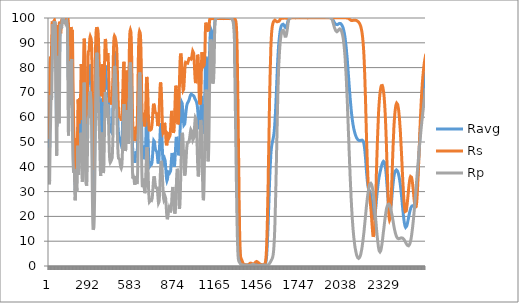
| Category | Ravg | Rs | Rp |
|---|---|---|---|
| 0 | 53.608 | 59.483 | 47.732 |
| 1 | 46.435 | 53.007 | 39.864 |
| 2 | 43.023 | 51.221 | 34.826 |
| 3 | 43.86 | 54.74 | 32.981 |
| 4 | 48.45 | 62.311 | 34.59 |
| 5 | 55.07 | 71.234 | 38.905 |
| 6 | 61.067 | 78.057 | 44.077 |
| 7 | 65.373 | 82.261 | 48.486 |
| 8 | 67.951 | 83.219 | 52.683 |
| 9 | 69.086 | 83.364 | 54.809 |
| 10 | 70.093 | 83.365 | 56.821 |
| 11 | 71.622 | 83.523 | 59.721 |
| 12 | 73.597 | 83.551 | 63.643 |
| 13 | 75.091 | 83.333 | 66.849 |
| 14 | 75.85 | 82.789 | 68.911 |
| 15 | 75.43 | 82.052 | 68.808 |
| 16 | 75.657 | 83.915 | 67.399 |
| 17 | 76.655 | 86.403 | 66.907 |
| 18 | 79.3 | 89.995 | 68.604 |
| 19 | 81.838 | 92.304 | 71.373 |
| 20 | 85.746 | 95.227 | 76.266 |
| 21 | 89.017 | 97.914 | 80.121 |
| 22 | 90.354 | 98.591 | 82.118 |
| 23 | 92.334 | 98.243 | 86.425 |
| 24 | 94.664 | 97.848 | 91.479 |
| 25 | 96.153 | 97.268 | 95.039 |
| 26 | 96.717 | 95.844 | 97.589 |
| 27 | 96.232 | 95.397 | 97.068 |
| 28 | 95.586 | 94.821 | 96.35 |
| 29 | 95.021 | 95.249 | 94.792 |
| 30 | 94.859 | 95.882 | 93.835 |
| 31 | 95.255 | 97.491 | 93.02 |
| 32 | 96.392 | 98.593 | 94.19 |
| 33 | 96.959 | 98.517 | 95.401 |
| 34 | 98.014 | 98.845 | 97.183 |
| 35 | 98.073 | 98.319 | 97.827 |
| 36 | 98.862 | 98.97 | 98.753 |
| 37 | 98.501 | 99.106 | 97.896 |
| 38 | 98.467 | 98.933 | 98 |
| 39 | 98.495 | 98.521 | 98.469 |
| 40 | 98.091 | 98.214 | 97.968 |
| 41 | 97.955 | 97.908 | 98.002 |
| 42 | 97.713 | 97.745 | 97.682 |
| 43 | 96.801 | 97.075 | 96.527 |
| 44 | 95.317 | 96.78 | 93.855 |
| 45 | 92.409 | 95.388 | 89.43 |
| 46 | 89.204 | 93.428 | 84.98 |
| 47 | 83.43 | 89.397 | 77.463 |
| 48 | 76.467 | 83.704 | 69.23 |
| 49 | 70.578 | 78.604 | 62.553 |
| 50 | 63.555 | 72.074 | 55.035 |
| 51 | 58.176 | 68.068 | 48.284 |
| 52 | 56.482 | 68.474 | 44.489 |
| 53 | 57.531 | 70.824 | 44.237 |
| 54 | 61.851 | 76.848 | 46.855 |
| 55 | 67.634 | 82.83 | 52.437 |
| 56 | 73.404 | 88.155 | 58.653 |
| 57 | 77.216 | 90.521 | 63.911 |
| 58 | 78.101 | 90.717 | 65.485 |
| 59 | 78.055 | 90.796 | 65.315 |
| 60 | 78.289 | 91.863 | 64.715 |
| 61 | 79.57 | 93.351 | 65.79 |
| 62 | 82.723 | 95.972 | 69.474 |
| 63 | 86.717 | 97.104 | 76.33 |
| 64 | 89.701 | 96.913 | 82.489 |
| 65 | 90.117 | 95.512 | 84.722 |
| 66 | 87.386 | 94.354 | 80.418 |
| 67 | 83.358 | 93.577 | 73.139 |
| 68 | 79.853 | 93.706 | 66 |
| 69 | 77.437 | 94.698 | 60.175 |
| 70 | 76.982 | 96.374 | 57.59 |
| 71 | 78.911 | 98.018 | 59.805 |
| 72 | 82.765 | 98.522 | 67.008 |
| 73 | 87.083 | 98.772 | 75.394 |
| 74 | 90.975 | 98.584 | 83.367 |
| 75 | 93.929 | 98.116 | 89.743 |
| 76 | 95.429 | 96.879 | 93.98 |
| 77 | 96.108 | 96.204 | 96.013 |
| 78 | 95.869 | 94.845 | 96.893 |
| 79 | 95.795 | 94.46 | 97.131 |
| 80 | 95.501 | 93.86 | 97.141 |
| 81 | 95.938 | 94.297 | 97.579 |
| 82 | 96.341 | 94.928 | 97.755 |
| 83 | 96.363 | 95.673 | 97.054 |
| 84 | 96.686 | 96.972 | 96.399 |
| 85 | 97.184 | 98.199 | 96.169 |
| 86 | 97.34 | 98.812 | 95.869 |
| 87 | 97.451 | 99.042 | 95.861 |
| 88 | 97.802 | 99.251 | 96.353 |
| 89 | 98.426 | 99.305 | 97.546 |
| 90 | 98.998 | 99.322 | 98.673 |
| 91 | 99.308 | 99.335 | 99.28 |
| 92 | 99.465 | 99.456 | 99.474 |
| 93 | 99.501 | 99.427 | 99.574 |
| 94 | 99.476 | 99.576 | 99.377 |
| 95 | 99.521 | 99.285 | 99.756 |
| 96 | 99.591 | 99.555 | 99.626 |
| 97 | 99.441 | 99.423 | 99.46 |
| 98 | 99.414 | 99.227 | 99.601 |
| 99 | 99.343 | 99.273 | 99.414 |
| 100 | 99.459 | 99.305 | 99.613 |
| 101 | 99.152 | 99.007 | 99.297 |
| 102 | 99.079 | 98.85 | 99.308 |
| 103 | 99.044 | 98.969 | 99.119 |
| 104 | 98.918 | 98.916 | 98.919 |
| 105 | 98.894 | 98.79 | 98.998 |
| 106 | 98.459 | 98.492 | 98.425 |
| 107 | 98.463 | 98.42 | 98.507 |
| 108 | 98.369 | 98.374 | 98.364 |
| 109 | 98.419 | 98.354 | 98.483 |
| 110 | 98.512 | 98.496 | 98.528 |
| 111 | 98.616 | 98.635 | 98.596 |
| 112 | 98.837 | 98.885 | 98.788 |
| 113 | 98.744 | 98.841 | 98.647 |
| 114 | 98.577 | 98.831 | 98.323 |
| 115 | 98.549 | 99.073 | 98.024 |
| 116 | 98.445 | 99.139 | 97.751 |
| 117 | 98.543 | 99.363 | 97.723 |
| 118 | 98.503 | 99.26 | 97.745 |
| 119 | 98.514 | 99.322 | 97.706 |
| 120 | 98.556 | 99.254 | 97.858 |
| 121 | 98.848 | 99.37 | 98.326 |
| 122 | 99.043 | 99.367 | 98.72 |
| 123 | 99.096 | 99.326 | 98.866 |
| 124 | 99.157 | 99.43 | 98.884 |
| 125 | 98.893 | 99.463 | 98.323 |
| 126 | 98.201 | 99.461 | 96.942 |
| 127 | 96.636 | 99.291 | 93.981 |
| 128 | 94.105 | 99.371 | 88.839 |
| 129 | 89.858 | 99.375 | 80.341 |
| 130 | 86.189 | 99.455 | 72.924 |
| 131 | 82.724 | 99.415 | 66.032 |
| 132 | 79.264 | 99.243 | 59.285 |
| 133 | 76.435 | 98.564 | 54.305 |
| 134 | 74.607 | 96.603 | 52.611 |
| 135 | 74.09 | 93.672 | 54.508 |
| 136 | 73.937 | 90.207 | 57.667 |
| 137 | 73.575 | 86.165 | 60.986 |
| 138 | 72.733 | 82.101 | 63.364 |
| 139 | 71.712 | 79.074 | 64.351 |
| 140 | 71.503 | 78.467 | 64.538 |
| 141 | 72.052 | 79.35 | 64.754 |
| 142 | 73.047 | 80.376 | 65.718 |
| 143 | 74.218 | 81.314 | 67.122 |
| 144 | 76.141 | 82.582 | 69.7 |
| 145 | 78.984 | 84.469 | 73.498 |
| 146 | 81.883 | 85.963 | 77.803 |
| 147 | 84.302 | 87.169 | 81.435 |
| 148 | 85.851 | 89.17 | 82.532 |
| 149 | 87.245 | 92.421 | 82.07 |
| 150 | 88.043 | 95.18 | 80.906 |
| 151 | 88.315 | 96.372 | 80.258 |
| 152 | 88.188 | 96.476 | 79.899 |
| 153 | 87.9 | 95.435 | 80.364 |
| 154 | 87.971 | 94.372 | 81.57 |
| 155 | 88.277 | 93.628 | 82.926 |
| 156 | 88.403 | 93.327 | 83.479 |
| 157 | 87.569 | 93.223 | 81.915 |
| 158 | 85.62 | 93.823 | 77.418 |
| 159 | 83.307 | 94.395 | 72.22 |
| 160 | 79.974 | 95.185 | 64.763 |
| 161 | 76.198 | 94.381 | 58.016 |
| 162 | 71.88 | 91.211 | 52.549 |
| 163 | 67.031 | 85.914 | 48.147 |
| 164 | 62.273 | 79.663 | 44.883 |
| 165 | 58.599 | 74.446 | 42.752 |
| 166 | 56.364 | 71.18 | 41.547 |
| 167 | 53.436 | 66.684 | 40.187 |
| 168 | 50.758 | 62.759 | 38.757 |
| 169 | 48.576 | 59.497 | 37.655 |
| 170 | 47.149 | 57.046 | 37.253 |
| 171 | 45.937 | 54.502 | 37.373 |
| 172 | 45.414 | 52.798 | 38.03 |
| 173 | 44.888 | 50.834 | 38.942 |
| 174 | 44.286 | 49.634 | 38.939 |
| 175 | 43.589 | 49.645 | 37.532 |
| 176 | 42.224 | 49.611 | 34.837 |
| 177 | 40.179 | 48.639 | 31.72 |
| 178 | 37.287 | 45.693 | 28.882 |
| 179 | 34.264 | 41.393 | 27.135 |
| 180 | 32.247 | 37.999 | 26.494 |
| 181 | 30.571 | 34.287 | 26.855 |
| 182 | 30.315 | 32.44 | 28.191 |
| 183 | 31.506 | 33.014 | 29.999 |
| 184 | 33.687 | 35.505 | 31.87 |
| 185 | 36.59 | 39.681 | 33.499 |
| 186 | 39.305 | 44.121 | 34.49 |
| 187 | 41.421 | 48.145 | 34.698 |
| 188 | 42.486 | 50.901 | 34.071 |
| 189 | 42.09 | 51.621 | 32.559 |
| 190 | 40.496 | 50.023 | 30.969 |
| 191 | 38.647 | 47.44 | 29.854 |
| 192 | 37.428 | 44.8 | 30.055 |
| 193 | 37.415 | 43.256 | 31.573 |
| 194 | 38.949 | 43.371 | 34.526 |
| 195 | 41.984 | 45.332 | 38.635 |
| 196 | 46.026 | 49.079 | 42.972 |
| 197 | 50.354 | 54.182 | 46.526 |
| 198 | 54.06 | 59.632 | 48.489 |
| 199 | 56.118 | 64.049 | 48.187 |
| 200 | 56.406 | 66.634 | 46.178 |
| 201 | 55.095 | 67.144 | 43.045 |
| 202 | 52.978 | 65.912 | 40.044 |
| 203 | 50.144 | 62.727 | 37.561 |
| 204 | 48.413 | 59.997 | 36.83 |
| 205 | 47.707 | 58.114 | 37.301 |
| 206 | 48.113 | 57.523 | 38.703 |
| 207 | 49.241 | 57.899 | 40.583 |
| 208 | 50.864 | 59.462 | 42.267 |
| 209 | 52.944 | 62.443 | 43.444 |
| 210 | 54.112 | 64.91 | 43.313 |
| 211 | 54.851 | 66.922 | 42.781 |
| 212 | 54.762 | 67.67 | 41.854 |
| 213 | 54.342 | 67.057 | 41.627 |
| 214 | 54.061 | 66.236 | 41.887 |
| 215 | 54.467 | 65.886 | 43.048 |
| 216 | 55.835 | 66.274 | 45.396 |
| 217 | 57.604 | 67.475 | 47.733 |
| 218 | 60.353 | 70.077 | 50.629 |
| 219 | 62.86 | 73.208 | 52.513 |
| 220 | 65.431 | 77.16 | 53.701 |
| 221 | 66.684 | 79.825 | 53.543 |
| 222 | 66.899 | 81.464 | 52.334 |
| 223 | 65.587 | 81.52 | 49.654 |
| 224 | 62.937 | 79.634 | 46.239 |
| 225 | 60.214 | 77.056 | 43.372 |
| 226 | 56.524 | 73.111 | 39.938 |
| 227 | 53.706 | 69.797 | 37.614 |
| 228 | 50.51 | 65.733 | 35.286 |
| 229 | 48.088 | 62.181 | 33.995 |
| 230 | 47.027 | 60.121 | 33.932 |
| 231 | 46.936 | 58.944 | 34.929 |
| 232 | 48.378 | 59.592 | 37.164 |
| 233 | 50.5 | 61.281 | 39.719 |
| 234 | 54.137 | 64.52 | 43.753 |
| 235 | 58.521 | 68.477 | 48.565 |
| 236 | 63.361 | 72.911 | 53.811 |
| 237 | 67.374 | 76.717 | 58.03 |
| 238 | 72.332 | 81.597 | 63.067 |
| 239 | 76.687 | 85.744 | 67.63 |
| 240 | 79.946 | 88.999 | 70.894 |
| 241 | 81.9 | 90.788 | 73.012 |
| 242 | 82.799 | 91.661 | 73.937 |
| 243 | 82.668 | 91.755 | 73.58 |
| 244 | 81.428 | 91.016 | 71.84 |
| 245 | 79.306 | 89.786 | 68.827 |
| 246 | 76.294 | 87.88 | 64.708 |
| 247 | 73.23 | 85.715 | 60.745 |
| 248 | 68.789 | 82.586 | 54.991 |
| 249 | 64.043 | 78.823 | 49.262 |
| 250 | 59.616 | 74.923 | 44.31 |
| 251 | 55.467 | 70.804 | 40.13 |
| 252 | 52.031 | 67.029 | 37.033 |
| 253 | 49.355 | 63.787 | 34.923 |
| 254 | 47.381 | 61.006 | 33.755 |
| 255 | 46.4 | 59.491 | 33.309 |
| 256 | 45.826 | 58.563 | 33.089 |
| 257 | 45.34 | 57.857 | 32.823 |
| 258 | 44.894 | 57.278 | 32.51 |
| 259 | 44.723 | 57.035 | 32.41 |
| 260 | 45.084 | 57.352 | 32.816 |
| 261 | 46.368 | 58.699 | 34.038 |
| 262 | 48.505 | 60.741 | 36.27 |
| 263 | 51.361 | 63.396 | 39.326 |
| 264 | 54.827 | 66.529 | 43.126 |
| 265 | 58.631 | 69.965 | 47.297 |
| 266 | 62.666 | 73.91 | 51.421 |
| 267 | 66.483 | 78.011 | 54.955 |
| 268 | 69.662 | 81.654 | 57.67 |
| 269 | 71.732 | 84.255 | 59.208 |
| 270 | 72.759 | 85.671 | 59.846 |
| 271 | 73.195 | 86.409 | 59.982 |
| 272 | 73.159 | 86.423 | 59.894 |
| 273 | 73.195 | 86.453 | 59.936 |
| 274 | 73.357 | 86.43 | 60.285 |
| 275 | 73.793 | 86.497 | 61.089 |
| 276 | 74.632 | 86.863 | 62.402 |
| 277 | 75.978 | 87.765 | 64.192 |
| 278 | 77.324 | 88.684 | 65.965 |
| 279 | 78.514 | 89.665 | 67.364 |
| 280 | 79.812 | 90.715 | 68.909 |
| 281 | 80.758 | 91.652 | 69.863 |
| 282 | 81.254 | 92.166 | 70.341 |
| 283 | 81.388 | 92.423 | 70.352 |
| 284 | 81.372 | 92.629 | 70.116 |
| 285 | 81.024 | 92.45 | 69.598 |
| 286 | 80.708 | 92.423 | 68.994 |
| 287 | 80.338 | 92.181 | 68.495 |
| 288 | 79.936 | 92.064 | 67.808 |
| 289 | 79.477 | 91.921 | 67.032 |
| 290 | 78.732 | 91.638 | 65.825 |
| 291 | 77.848 | 91.347 | 64.349 |
| 292 | 76.177 | 90.584 | 61.771 |
| 293 | 73.722 | 89.334 | 58.11 |
| 294 | 70.922 | 87.492 | 54.353 |
| 295 | 67.296 | 84.783 | 49.809 |
| 296 | 61.693 | 79.908 | 43.477 |
| 297 | 56.572 | 74.991 | 38.153 |
| 298 | 49.999 | 68.146 | 31.851 |
| 299 | 44.865 | 62.458 | 27.273 |
| 300 | 40.141 | 57.043 | 23.239 |
| 301 | 34.94 | 50.595 | 19.284 |
| 302 | 31.83 | 46.567 | 17.094 |
| 303 | 29.4 | 43.153 | 15.647 |
| 304 | 27.4 | 40.145 | 14.656 |
| 305 | 26.617 | 38.887 | 14.347 |
| 306 | 26.378 | 38.489 | 14.267 |
| 307 | 26.668 | 38.913 | 14.423 |
| 308 | 27.256 | 39.733 | 14.779 |
| 309 | 28.25 | 41.049 | 15.451 |
| 310 | 29.66 | 42.811 | 16.509 |
| 311 | 31.693 | 45.319 | 18.067 |
| 312 | 34.47 | 48.738 | 20.202 |
| 313 | 38.898 | 54.013 | 23.783 |
| 314 | 43.245 | 58.957 | 27.534 |
| 315 | 47.947 | 64.057 | 31.837 |
| 316 | 52.922 | 69.109 | 36.734 |
| 317 | 57.984 | 73.937 | 42.031 |
| 318 | 62.905 | 78.31 | 47.5 |
| 319 | 67.734 | 82.307 | 53.161 |
| 320 | 72.327 | 85.833 | 58.82 |
| 321 | 76.511 | 88.749 | 64.273 |
| 322 | 80.131 | 91.037 | 69.225 |
| 323 | 83.211 | 92.762 | 73.661 |
| 324 | 85.722 | 93.975 | 77.469 |
| 325 | 87.607 | 94.8 | 80.413 |
| 326 | 89.048 | 95.354 | 82.743 |
| 327 | 90.086 | 95.766 | 84.405 |
| 328 | 90.697 | 95.977 | 85.417 |
| 329 | 91.032 | 96.074 | 85.991 |
| 330 | 91.105 | 96.115 | 86.096 |
| 331 | 90.956 | 96.123 | 85.789 |
| 332 | 90.589 | 96.096 | 85.083 |
| 333 | 89.962 | 96.008 | 83.916 |
| 334 | 89.02 | 95.818 | 82.222 |
| 335 | 87.886 | 95.637 | 80.134 |
| 336 | 86.819 | 95.399 | 78.24 |
| 337 | 85.265 | 95.074 | 75.455 |
| 338 | 83.43 | 94.426 | 72.434 |
| 339 | 81.464 | 93.552 | 69.376 |
| 340 | 79.335 | 92.26 | 66.411 |
| 341 | 77.151 | 90.53 | 63.772 |
| 342 | 75.015 | 88.55 | 61.481 |
| 343 | 72.988 | 86.437 | 59.539 |
| 344 | 71.575 | 84.811 | 58.34 |
| 345 | 69.923 | 82.868 | 56.977 |
| 346 | 68.516 | 81.255 | 55.777 |
| 347 | 67.22 | 79.934 | 54.506 |
| 348 | 65.98 | 78.999 | 52.961 |
| 349 | 64.635 | 78.337 | 50.933 |
| 350 | 63.128 | 77.867 | 48.389 |
| 351 | 61.367 | 77.308 | 45.425 |
| 352 | 59.882 | 76.583 | 43.181 |
| 353 | 57.687 | 75.017 | 40.357 |
| 354 | 55.569 | 73.036 | 38.102 |
| 355 | 53.877 | 70.995 | 36.758 |
| 356 | 52.894 | 69.45 | 36.338 |
| 357 | 52.651 | 68.489 | 36.814 |
| 358 | 53.226 | 68.102 | 38.35 |
| 359 | 54.513 | 68.382 | 40.644 |
| 360 | 55.909 | 69.022 | 42.796 |
| 361 | 58.188 | 70.552 | 45.824 |
| 362 | 60.817 | 72.802 | 48.832 |
| 363 | 63.395 | 75.484 | 51.306 |
| 364 | 65.555 | 78.055 | 53.054 |
| 365 | 66.974 | 80.143 | 53.804 |
| 366 | 67.526 | 81.315 | 53.737 |
| 367 | 67.221 | 81.56 | 52.883 |
| 368 | 66.125 | 80.931 | 51.319 |
| 369 | 64.494 | 79.659 | 49.33 |
| 370 | 62.393 | 77.824 | 46.962 |
| 371 | 59.979 | 75.462 | 44.497 |
| 372 | 57.451 | 72.885 | 42.017 |
| 373 | 55.103 | 70.298 | 39.908 |
| 374 | 53.24 | 68.199 | 38.282 |
| 375 | 52.174 | 66.865 | 37.484 |
| 376 | 51.899 | 66.307 | 37.491 |
| 377 | 52.614 | 66.71 | 38.518 |
| 378 | 54.178 | 68.01 | 40.346 |
| 379 | 56.429 | 69.86 | 42.998 |
| 380 | 59.337 | 72.453 | 46.22 |
| 381 | 62.538 | 75.247 | 49.83 |
| 382 | 66.084 | 78.514 | 53.654 |
| 383 | 69.656 | 81.801 | 57.512 |
| 384 | 72.993 | 84.822 | 61.163 |
| 385 | 75.926 | 87.47 | 64.383 |
| 386 | 78.626 | 89.765 | 67.488 |
| 387 | 80.07 | 90.962 | 69.178 |
| 388 | 80.823 | 91.524 | 70.121 |
| 389 | 81.085 | 91.836 | 70.334 |
| 390 | 80.756 | 91.605 | 69.907 |
| 391 | 79.721 | 90.902 | 68.541 |
| 392 | 78.491 | 89.891 | 67.091 |
| 393 | 77.058 | 88.668 | 65.448 |
| 394 | 75.422 | 87.167 | 63.676 |
| 395 | 73.658 | 85.482 | 61.834 |
| 396 | 72.47 | 84.239 | 60.701 |
| 397 | 71.669 | 83.329 | 60.009 |
| 398 | 71.179 | 82.603 | 59.754 |
| 399 | 71.193 | 82.374 | 60.013 |
| 400 | 71.51 | 82.452 | 60.567 |
| 401 | 72.368 | 83.063 | 61.673 |
| 402 | 73.252 | 83.76 | 62.744 |
| 403 | 74.315 | 84.7 | 63.93 |
| 404 | 75.015 | 85.375 | 64.655 |
| 405 | 75.498 | 85.824 | 65.172 |
| 406 | 75.478 | 85.931 | 65.025 |
| 407 | 74.802 | 85.261 | 64.342 |
| 408 | 73.853 | 84.405 | 63.301 |
| 409 | 72.041 | 82.689 | 61.392 |
| 410 | 69.737 | 80.447 | 59.027 |
| 411 | 67.72 | 78.514 | 56.926 |
| 412 | 65.103 | 75.955 | 54.252 |
| 413 | 62.568 | 73.515 | 51.62 |
| 414 | 60.694 | 71.701 | 49.686 |
| 415 | 58.716 | 69.83 | 47.603 |
| 416 | 57.014 | 68.285 | 45.744 |
| 417 | 55.799 | 67.244 | 44.354 |
| 418 | 55.122 | 66.764 | 43.481 |
| 419 | 54.54 | 66.387 | 42.693 |
| 420 | 54.287 | 66.395 | 42.18 |
| 421 | 54.216 | 66.583 | 41.849 |
| 422 | 54.243 | 66.768 | 41.719 |
| 423 | 54.295 | 66.909 | 41.682 |
| 424 | 54.399 | 67.054 | 41.745 |
| 425 | 54.47 | 67.042 | 41.898 |
| 426 | 54.502 | 66.93 | 42.073 |
| 427 | 54.486 | 66.747 | 42.225 |
| 428 | 54.437 | 66.439 | 42.435 |
| 429 | 54.289 | 65.996 | 42.581 |
| 430 | 54.139 | 65.587 | 42.692 |
| 431 | 53.981 | 65.198 | 42.764 |
| 432 | 53.948 | 65.123 | 42.774 |
| 433 | 54.103 | 65.359 | 42.847 |
| 434 | 54.643 | 66.215 | 43.071 |
| 435 | 55.393 | 67.311 | 43.476 |
| 436 | 56.428 | 68.644 | 44.213 |
| 437 | 57.764 | 70.189 | 45.34 |
| 438 | 59.385 | 71.8 | 46.97 |
| 439 | 61.177 | 73.425 | 48.929 |
| 440 | 63.264 | 75.289 | 51.239 |
| 441 | 65.751 | 77.543 | 53.958 |
| 442 | 68.647 | 80.262 | 57.032 |
| 443 | 71.718 | 83.098 | 60.338 |
| 444 | 74.773 | 85.797 | 63.75 |
| 445 | 77.677 | 88.105 | 67.249 |
| 446 | 80.171 | 89.779 | 70.563 |
| 447 | 82.222 | 90.975 | 73.47 |
| 448 | 83.823 | 91.763 | 75.883 |
| 449 | 85.087 | 92.354 | 77.821 |
| 450 | 85.957 | 92.681 | 79.232 |
| 451 | 86.453 | 92.775 | 80.13 |
| 452 | 86.737 | 92.805 | 80.668 |
| 453 | 86.738 | 92.686 | 80.79 |
| 454 | 86.571 | 92.592 | 80.55 |
| 455 | 86.187 | 92.35 | 80.024 |
| 456 | 85.684 | 92.231 | 79.136 |
| 457 | 84.951 | 91.862 | 78.039 |
| 458 | 84.182 | 91.63 | 76.735 |
| 459 | 83.272 | 91.321 | 75.222 |
| 460 | 82.333 | 91.036 | 73.629 |
| 461 | 81.496 | 90.743 | 72.25 |
| 462 | 80.489 | 90.459 | 70.518 |
| 463 | 79.369 | 90.032 | 68.706 |
| 464 | 78.212 | 89.542 | 66.882 |
| 465 | 76.973 | 88.883 | 65.063 |
| 466 | 75.921 | 88.27 | 63.571 |
| 467 | 74.307 | 87.043 | 61.57 |
| 468 | 72.586 | 85.652 | 59.52 |
| 469 | 70.981 | 84.202 | 57.759 |
| 470 | 68.767 | 81.916 | 55.618 |
| 471 | 66.387 | 79.372 | 53.402 |
| 472 | 64.402 | 77.137 | 51.667 |
| 473 | 61.922 | 74.228 | 49.617 |
| 474 | 60.049 | 71.963 | 48.135 |
| 475 | 57.968 | 69.398 | 46.538 |
| 476 | 56.503 | 67.566 | 45.439 |
| 477 | 55.085 | 65.677 | 44.492 |
| 478 | 54.181 | 64.44 | 43.922 |
| 479 | 53.302 | 63.132 | 43.472 |
| 480 | 52.829 | 62.395 | 43.263 |
| 481 | 52.471 | 61.726 | 43.216 |
| 482 | 52.246 | 61.309 | 43.184 |
| 483 | 51.962 | 60.706 | 43.219 |
| 484 | 51.81 | 60.378 | 43.243 |
| 485 | 51.652 | 60.118 | 43.187 |
| 486 | 51.411 | 59.83 | 42.991 |
| 487 | 51.283 | 59.773 | 42.793 |
| 488 | 51.12 | 59.791 | 42.449 |
| 489 | 50.996 | 59.889 | 42.103 |
| 490 | 50.753 | 59.908 | 41.597 |
| 491 | 50.577 | 59.964 | 41.189 |
| 492 | 50.37 | 59.938 | 40.802 |
| 493 | 50.185 | 59.919 | 40.452 |
| 494 | 49.978 | 59.79 | 40.166 |
| 495 | 49.675 | 59.54 | 39.81 |
| 496 | 49.457 | 59.276 | 39.638 |
| 497 | 49.168 | 58.883 | 39.453 |
| 498 | 48.986 | 58.574 | 39.397 |
| 499 | 48.941 | 58.424 | 39.457 |
| 500 | 49.051 | 58.466 | 39.637 |
| 501 | 49.352 | 58.708 | 39.995 |
| 502 | 49.972 | 59.297 | 40.648 |
| 503 | 50.818 | 60.126 | 41.51 |
| 504 | 51.949 | 61.245 | 42.653 |
| 505 | 53.344 | 62.608 | 44.08 |
| 506 | 55.074 | 64.333 | 45.816 |
| 507 | 56.99 | 66.211 | 47.769 |
| 508 | 59.223 | 68.431 | 50.016 |
| 509 | 61.637 | 70.842 | 52.431 |
| 510 | 64.121 | 73.383 | 54.859 |
| 511 | 66.389 | 75.55 | 57.228 |
| 512 | 68.669 | 77.795 | 59.543 |
| 513 | 70.671 | 79.702 | 61.64 |
| 514 | 72.189 | 81.023 | 63.356 |
| 515 | 73.235 | 81.917 | 64.552 |
| 516 | 73.792 | 82.337 | 65.247 |
| 517 | 73.71 | 82.121 | 65.299 |
| 518 | 73.058 | 81.449 | 64.667 |
| 519 | 71.7 | 80.014 | 63.386 |
| 520 | 69.641 | 77.814 | 61.468 |
| 521 | 67.005 | 75.115 | 58.894 |
| 522 | 64.035 | 71.946 | 56.124 |
| 523 | 61.793 | 69.587 | 54 |
| 524 | 59.045 | 66.834 | 51.256 |
| 525 | 56.833 | 64.687 | 48.98 |
| 526 | 55.29 | 63.22 | 47.36 |
| 527 | 54.39 | 62.422 | 46.357 |
| 528 | 54.114 | 62.134 | 46.094 |
| 529 | 54.497 | 62.453 | 46.541 |
| 530 | 55.489 | 63.409 | 47.57 |
| 531 | 57.12 | 65.007 | 49.233 |
| 532 | 58.807 | 66.776 | 50.838 |
| 533 | 61.299 | 69.345 | 53.254 |
| 534 | 64.069 | 72.225 | 55.913 |
| 535 | 66.814 | 75.132 | 58.495 |
| 536 | 69.057 | 77.451 | 60.664 |
| 537 | 70.52 | 78.8 | 62.24 |
| 538 | 70.911 | 78.959 | 62.863 |
| 539 | 70.258 | 77.876 | 62.64 |
| 540 | 68.558 | 75.775 | 61.342 |
| 541 | 66.76 | 73.714 | 59.805 |
| 542 | 64.07 | 70.936 | 57.205 |
| 543 | 61.669 | 68.805 | 54.532 |
| 544 | 59.825 | 67.495 | 52.154 |
| 545 | 58.603 | 66.807 | 50.398 |
| 546 | 58.002 | 66.694 | 49.311 |
| 547 | 58.147 | 67.138 | 49.156 |
| 548 | 58.92 | 68.054 | 49.787 |
| 549 | 60.422 | 69.819 | 51.026 |
| 550 | 62.635 | 72.197 | 53.073 |
| 551 | 65.732 | 75.521 | 55.942 |
| 552 | 69.45 | 79.476 | 59.423 |
| 553 | 73.499 | 83.611 | 63.386 |
| 554 | 77.396 | 87.34 | 67.452 |
| 555 | 80.893 | 90.305 | 71.482 |
| 556 | 83.598 | 92.247 | 74.949 |
| 557 | 85.643 | 93.546 | 77.741 |
| 558 | 87.063 | 94.343 | 79.783 |
| 559 | 87.976 | 94.79 | 81.163 |
| 560 | 88.606 | 95.189 | 82.022 |
| 561 | 88.706 | 95.213 | 82.2 |
| 562 | 88.565 | 95.236 | 81.894 |
| 563 | 88.022 | 95.002 | 81.042 |
| 564 | 87.175 | 94.632 | 79.717 |
| 565 | 85.885 | 94.036 | 77.733 |
| 566 | 83.624 | 92.851 | 74.397 |
| 567 | 81.258 | 91.457 | 71.059 |
| 568 | 78.35 | 89.506 | 67.194 |
| 569 | 74.84 | 86.738 | 62.941 |
| 570 | 70.897 | 83.327 | 58.467 |
| 571 | 66.738 | 79.339 | 54.137 |
| 572 | 61.602 | 74.101 | 49.102 |
| 573 | 57.73 | 69.951 | 45.51 |
| 574 | 54.363 | 66.267 | 42.459 |
| 575 | 50.789 | 62.197 | 39.38 |
| 576 | 48.473 | 59.439 | 37.506 |
| 577 | 46.608 | 57.016 | 36.199 |
| 578 | 44.991 | 54.719 | 35.263 |
| 579 | 44.193 | 53.351 | 35.034 |
| 580 | 43.823 | 52.6 | 35.046 |
| 581 | 43.84 | 52.294 | 35.386 |
| 582 | 44.031 | 52.417 | 35.645 |
| 583 | 44.327 | 52.78 | 35.874 |
| 584 | 44.462 | 52.999 | 35.924 |
| 585 | 44.273 | 52.901 | 35.646 |
| 586 | 43.943 | 52.623 | 35.262 |
| 587 | 43.313 | 52.027 | 34.599 |
| 588 | 42.778 | 51.509 | 34.048 |
| 589 | 42.159 | 50.88 | 33.438 |
| 590 | 41.827 | 50.583 | 33.072 |
| 591 | 41.625 | 50.459 | 32.79 |
| 592 | 41.691 | 50.629 | 32.754 |
| 593 | 41.924 | 50.953 | 32.894 |
| 594 | 42.518 | 51.696 | 33.34 |
| 595 | 43.293 | 52.689 | 33.896 |
| 596 | 44.031 | 53.594 | 34.469 |
| 597 | 44.935 | 54.684 | 35.186 |
| 598 | 45.74 | 55.609 | 35.872 |
| 599 | 46.243 | 56.161 | 36.326 |
| 600 | 46.356 | 56.24 | 36.472 |
| 601 | 46.136 | 55.883 | 36.39 |
| 602 | 45.541 | 55.153 | 35.929 |
| 603 | 44.823 | 54.435 | 35.212 |
| 604 | 44.219 | 54.093 | 34.346 |
| 605 | 43.914 | 54.218 | 33.609 |
| 606 | 43.943 | 54.801 | 33.085 |
| 607 | 44.448 | 55.912 | 32.983 |
| 608 | 45.405 | 57.377 | 33.432 |
| 609 | 46.827 | 59.196 | 34.458 |
| 610 | 48.779 | 61.623 | 35.936 |
| 611 | 51.374 | 64.617 | 38.13 |
| 612 | 54.409 | 67.932 | 40.886 |
| 613 | 57.813 | 71.672 | 43.953 |
| 614 | 61.613 | 75.696 | 47.531 |
| 615 | 65.686 | 79.843 | 51.528 |
| 616 | 69.616 | 83.587 | 55.644 |
| 617 | 73.253 | 86.8 | 59.705 |
| 618 | 76.39 | 89.264 | 63.517 |
| 619 | 79.097 | 91.116 | 67.077 |
| 620 | 81.307 | 92.404 | 70.211 |
| 621 | 83.323 | 93.445 | 73.201 |
| 622 | 84.627 | 94.098 | 75.156 |
| 623 | 85.493 | 94.43 | 76.556 |
| 624 | 86.058 | 94.659 | 77.457 |
| 625 | 86.386 | 94.761 | 78.01 |
| 626 | 86.406 | 94.758 | 78.053 |
| 627 | 86.185 | 94.672 | 77.697 |
| 628 | 85.681 | 94.392 | 76.969 |
| 629 | 84.868 | 93.968 | 75.768 |
| 630 | 83.7 | 93.302 | 74.098 |
| 631 | 82.102 | 92.352 | 71.853 |
| 632 | 80.086 | 91.064 | 69.109 |
| 633 | 77.594 | 89.334 | 65.855 |
| 634 | 74.549 | 86.971 | 62.126 |
| 635 | 71.039 | 84.086 | 57.991 |
| 636 | 67.141 | 80.499 | 53.783 |
| 637 | 63.038 | 76.632 | 49.445 |
| 638 | 59.031 | 72.801 | 45.261 |
| 639 | 55.416 | 69.228 | 41.604 |
| 640 | 52.291 | 66.251 | 38.332 |
| 641 | 49.772 | 63.738 | 35.807 |
| 642 | 47.728 | 61.61 | 33.847 |
| 643 | 46.218 | 59.973 | 32.463 |
| 644 | 45.296 | 58.829 | 31.762 |
| 645 | 44.962 | 58.323 | 31.601 |
| 646 | 45.045 | 58.265 | 31.826 |
| 647 | 45.604 | 58.721 | 32.487 |
| 648 | 46.421 | 59.518 | 33.324 |
| 649 | 47.145 | 60.252 | 34.037 |
| 650 | 47.943 | 61.12 | 34.765 |
| 651 | 48.525 | 61.813 | 35.236 |
| 652 | 48.644 | 61.963 | 35.324 |
| 653 | 48.35 | 61.626 | 35.074 |
| 654 | 47.57 | 60.764 | 34.375 |
| 655 | 46.715 | 59.801 | 33.63 |
| 656 | 45.538 | 58.539 | 32.538 |
| 657 | 44.412 | 57.395 | 31.429 |
| 658 | 43.691 | 56.764 | 30.617 |
| 659 | 43.032 | 56.281 | 29.784 |
| 660 | 42.758 | 56.148 | 29.367 |
| 661 | 42.796 | 56.373 | 29.22 |
| 662 | 43.19 | 56.931 | 29.449 |
| 663 | 43.888 | 57.794 | 29.981 |
| 664 | 45.173 | 59.231 | 31.115 |
| 665 | 46.486 | 60.659 | 32.312 |
| 666 | 48.467 | 62.723 | 34.21 |
| 667 | 50.282 | 64.607 | 35.958 |
| 668 | 52.174 | 66.563 | 37.786 |
| 669 | 54.676 | 69.143 | 40.208 |
| 670 | 56.575 | 71.123 | 42.028 |
| 671 | 58.32 | 72.947 | 43.694 |
| 672 | 60.139 | 74.718 | 45.56 |
| 673 | 61.175 | 75.685 | 46.664 |
| 674 | 61.832 | 76.233 | 47.431 |
| 675 | 62.109 | 76.364 | 47.854 |
| 676 | 62.012 | 76.157 | 47.867 |
| 677 | 61.345 | 75.289 | 47.4 |
| 678 | 60.412 | 74.239 | 46.584 |
| 679 | 59.136 | 72.811 | 45.462 |
| 680 | 57.644 | 71.199 | 44.089 |
| 681 | 55.837 | 69.248 | 42.426 |
| 682 | 53.913 | 67.25 | 40.576 |
| 683 | 51.925 | 65.231 | 38.619 |
| 684 | 49.912 | 63.213 | 36.61 |
| 685 | 48.006 | 61.38 | 34.632 |
| 686 | 45.825 | 59.359 | 32.291 |
| 687 | 44.305 | 57.946 | 30.663 |
| 688 | 43.011 | 56.804 | 29.218 |
| 689 | 41.963 | 55.93 | 27.996 |
| 690 | 41.148 | 55.289 | 27.006 |
| 691 | 40.571 | 54.843 | 26.299 |
| 692 | 40.226 | 54.621 | 25.831 |
| 693 | 40.087 | 54.544 | 25.629 |
| 694 | 40.028 | 54.484 | 25.571 |
| 695 | 40.118 | 54.588 | 25.649 |
| 696 | 40.236 | 54.664 | 25.808 |
| 697 | 40.359 | 54.702 | 26.016 |
| 698 | 40.536 | 54.786 | 26.285 |
| 699 | 40.691 | 54.87 | 26.513 |
| 700 | 40.788 | 54.884 | 26.692 |
| 701 | 40.855 | 54.93 | 26.78 |
| 702 | 40.878 | 54.941 | 26.814 |
| 703 | 40.86 | 54.952 | 26.768 |
| 704 | 40.829 | 54.986 | 26.673 |
| 705 | 40.822 | 55.086 | 26.558 |
| 706 | 40.858 | 55.235 | 26.481 |
| 707 | 40.981 | 55.516 | 26.447 |
| 708 | 41.163 | 55.854 | 26.473 |
| 709 | 41.477 | 56.351 | 26.602 |
| 710 | 41.784 | 56.758 | 26.809 |
| 711 | 42.316 | 57.446 | 27.186 |
| 712 | 42.949 | 58.224 | 27.675 |
| 713 | 43.694 | 59.073 | 28.314 |
| 714 | 44.551 | 60.025 | 29.076 |
| 715 | 45.434 | 60.931 | 29.937 |
| 716 | 46.383 | 61.935 | 30.83 |
| 717 | 47.342 | 62.862 | 31.823 |
| 718 | 48.257 | 63.763 | 32.751 |
| 719 | 49.088 | 64.547 | 33.63 |
| 720 | 49.601 | 64.974 | 34.228 |
| 721 | 50.185 | 65.423 | 34.946 |
| 722 | 50.602 | 65.68 | 35.525 |
| 723 | 50.842 | 65.775 | 35.908 |
| 724 | 50.891 | 65.644 | 36.138 |
| 725 | 50.792 | 65.383 | 36.201 |
| 726 | 50.549 | 65.031 | 36.066 |
| 727 | 50.161 | 64.511 | 35.812 |
| 728 | 49.708 | 63.987 | 35.429 |
| 729 | 49.253 | 63.579 | 34.927 |
| 730 | 48.681 | 62.991 | 34.37 |
| 731 | 48.204 | 62.61 | 33.798 |
| 732 | 47.733 | 62.241 | 33.226 |
| 733 | 47.351 | 61.996 | 32.706 |
| 734 | 47.026 | 61.775 | 32.277 |
| 735 | 46.784 | 61.668 | 31.9 |
| 736 | 46.624 | 61.614 | 31.635 |
| 737 | 46.567 | 61.673 | 31.461 |
| 738 | 46.531 | 61.682 | 31.38 |
| 739 | 46.518 | 61.688 | 31.347 |
| 740 | 46.509 | 61.617 | 31.4 |
| 741 | 46.49 | 61.531 | 31.449 |
| 742 | 46.396 | 61.295 | 31.496 |
| 743 | 46.204 | 60.907 | 31.501 |
| 744 | 45.93 | 60.395 | 31.465 |
| 745 | 45.449 | 59.65 | 31.249 |
| 746 | 44.972 | 58.98 | 30.964 |
| 747 | 44.401 | 58.236 | 30.565 |
| 748 | 43.791 | 57.513 | 30.069 |
| 749 | 43.155 | 56.898 | 29.413 |
| 750 | 42.577 | 56.439 | 28.716 |
| 751 | 41.964 | 56.103 | 27.826 |
| 752 | 41.598 | 56.069 | 27.127 |
| 753 | 41.318 | 56.208 | 26.428 |
| 754 | 41.193 | 56.492 | 25.894 |
| 755 | 41.314 | 57.243 | 25.384 |
| 756 | 41.605 | 58.033 | 25.176 |
| 757 | 42.082 | 58.998 | 25.167 |
| 758 | 42.903 | 60.382 | 25.423 |
| 759 | 43.744 | 61.606 | 25.882 |
| 760 | 45.059 | 63.393 | 26.725 |
| 761 | 46.212 | 64.812 | 27.613 |
| 762 | 47.46 | 66.265 | 28.654 |
| 763 | 49.123 | 68.091 | 30.154 |
| 764 | 50.458 | 69.429 | 31.487 |
| 765 | 52.005 | 70.882 | 33.128 |
| 766 | 53.263 | 72.014 | 34.511 |
| 767 | 54.604 | 73.019 | 36.188 |
| 768 | 55.518 | 73.552 | 37.484 |
| 769 | 56.468 | 73.993 | 38.942 |
| 770 | 57.115 | 73.987 | 40.244 |
| 771 | 57.416 | 73.789 | 41.043 |
| 772 | 57.531 | 73.23 | 41.832 |
| 773 | 57.32 | 72.248 | 42.392 |
| 774 | 56.963 | 71.342 | 42.583 |
| 775 | 56.189 | 69.794 | 42.583 |
| 776 | 55.181 | 68.089 | 42.272 |
| 777 | 53.949 | 66.164 | 41.734 |
| 778 | 52.813 | 64.546 | 41.081 |
| 779 | 51.318 | 62.573 | 40.064 |
| 780 | 49.766 | 60.67 | 38.863 |
| 781 | 48.237 | 58.915 | 37.56 |
| 782 | 46.741 | 57.314 | 36.168 |
| 783 | 45.292 | 55.897 | 34.686 |
| 784 | 44.052 | 54.885 | 33.218 |
| 785 | 43.15 | 54.196 | 32.104 |
| 786 | 42.227 | 53.634 | 30.821 |
| 787 | 41.538 | 53.392 | 29.685 |
| 788 | 41.03 | 53.34 | 28.719 |
| 789 | 40.771 | 53.631 | 27.911 |
| 790 | 40.703 | 54.086 | 27.319 |
| 791 | 40.742 | 54.562 | 26.921 |
| 792 | 40.97 | 55.22 | 26.72 |
| 793 | 41.376 | 56.027 | 26.724 |
| 794 | 41.783 | 56.7 | 26.865 |
| 795 | 42.186 | 57.227 | 27.144 |
| 796 | 42.595 | 57.695 | 27.495 |
| 797 | 42.868 | 57.912 | 27.823 |
| 798 | 43.006 | 57.874 | 28.138 |
| 799 | 42.972 | 57.581 | 28.363 |
| 800 | 42.803 | 57.088 | 28.518 |
| 801 | 42.408 | 56.29 | 28.526 |
| 802 | 41.797 | 55.241 | 28.353 |
| 803 | 41.093 | 54.202 | 27.984 |
| 804 | 40.317 | 53.138 | 27.496 |
| 805 | 39.449 | 52.09 | 26.808 |
| 806 | 38.597 | 51.18 | 26.014 |
| 807 | 37.738 | 50.348 | 25.128 |
| 808 | 36.897 | 49.604 | 24.19 |
| 809 | 36.156 | 49.108 | 23.204 |
| 810 | 35.501 | 48.774 | 22.228 |
| 811 | 34.924 | 48.663 | 21.184 |
| 812 | 34.557 | 48.719 | 20.395 |
| 813 | 34.379 | 48.984 | 19.774 |
| 814 | 34.34 | 49.382 | 19.298 |
| 815 | 34.461 | 49.916 | 19.006 |
| 816 | 34.681 | 50.494 | 18.869 |
| 817 | 35.05 | 51.173 | 18.927 |
| 818 | 35.525 | 51.878 | 19.172 |
| 819 | 36.091 | 52.612 | 19.57 |
| 820 | 36.192 | 52.661 | 19.723 |
| 821 | 36.742 | 53.146 | 20.339 |
| 822 | 37.2 | 53.415 | 20.985 |
| 823 | 37.576 | 53.54 | 21.612 |
| 824 | 37.803 | 53.487 | 22.12 |
| 825 | 37.988 | 53.332 | 22.644 |
| 826 | 38.058 | 53.032 | 23.083 |
| 827 | 38.005 | 52.631 | 23.38 |
| 828 | 37.919 | 52.279 | 23.559 |
| 829 | 37.739 | 51.917 | 23.562 |
| 830 | 37.618 | 51.752 | 23.483 |
| 831 | 37.447 | 51.638 | 23.255 |
| 832 | 37.279 | 51.644 | 22.914 |
| 833 | 37.206 | 51.786 | 22.626 |
| 834 | 37.179 | 52.134 | 22.224 |
| 835 | 37.27 | 52.693 | 21.848 |
| 836 | 37.424 | 53.228 | 21.619 |
| 837 | 37.755 | 54.1 | 21.409 |
| 838 | 38.257 | 55.161 | 21.352 |
| 839 | 38.737 | 56.052 | 21.421 |
| 840 | 39.458 | 57.243 | 21.673 |
| 841 | 40.116 | 58.226 | 22.006 |
| 842 | 41.048 | 59.461 | 22.635 |
| 843 | 41.832 | 60.404 | 23.261 |
| 844 | 42.771 | 61.339 | 24.203 |
| 845 | 43.519 | 61.954 | 25.085 |
| 846 | 44.185 | 62.347 | 26.022 |
| 847 | 44.894 | 62.553 | 27.235 |
| 848 | 45.289 | 62.394 | 28.184 |
| 849 | 45.548 | 61.786 | 29.311 |
| 850 | 45.63 | 61.14 | 30.12 |
| 851 | 45.516 | 60.241 | 30.791 |
| 852 | 45.176 | 58.927 | 31.425 |
| 853 | 44.784 | 57.822 | 31.745 |
| 854 | 44.276 | 56.724 | 31.829 |
| 855 | 43.703 | 55.68 | 31.725 |
| 856 | 42.975 | 54.653 | 31.297 |
| 857 | 42.391 | 54.075 | 30.707 |
| 858 | 41.81 | 53.668 | 29.951 |
| 859 | 41.238 | 53.492 | 28.985 |
| 860 | 40.766 | 53.604 | 27.927 |
| 861 | 40.366 | 53.946 | 26.785 |
| 862 | 40.048 | 54.794 | 25.302 |
| 863 | 39.962 | 55.757 | 24.167 |
| 864 | 40.036 | 56.939 | 23.133 |
| 865 | 40.324 | 58.385 | 22.263 |
| 866 | 40.778 | 59.991 | 21.565 |
| 867 | 41.452 | 61.776 | 21.129 |
| 868 | 42.286 | 63.641 | 20.931 |
| 869 | 43.253 | 65.5 | 21.006 |
| 870 | 44.341 | 67.299 | 21.383 |
| 871 | 45.498 | 68.945 | 22.051 |
| 872 | 46.686 | 70.356 | 23.017 |
| 873 | 47.811 | 71.447 | 24.175 |
| 874 | 48.912 | 72.222 | 25.602 |
| 875 | 49.937 | 72.698 | 27.176 |
| 876 | 50.827 | 72.792 | 28.862 |
| 877 | 51.536 | 72.454 | 30.619 |
| 878 | 52.036 | 71.734 | 32.339 |
| 879 | 52.319 | 70.665 | 33.974 |
| 880 | 52.337 | 69.185 | 35.489 |
| 881 | 52.132 | 67.469 | 36.795 |
| 882 | 51.726 | 65.576 | 37.877 |
| 883 | 51.126 | 63.578 | 38.675 |
| 884 | 50.464 | 61.739 | 39.188 |
| 885 | 49.707 | 60.074 | 39.341 |
| 886 | 48.991 | 58.807 | 39.175 |
| 887 | 48.255 | 57.802 | 38.708 |
| 888 | 47.506 | 57.129 | 37.882 |
| 889 | 46.806 | 56.807 | 36.805 |
| 890 | 46.162 | 56.861 | 35.463 |
| 891 | 45.674 | 57.06 | 34.289 |
| 892 | 45.174 | 57.753 | 32.595 |
| 893 | 44.819 | 58.818 | 30.82 |
| 894 | 44.633 | 60.212 | 29.054 |
| 895 | 44.704 | 62.015 | 27.394 |
| 896 | 45.056 | 64.275 | 25.838 |
| 897 | 45.675 | 66.783 | 24.567 |
| 898 | 46.573 | 69.516 | 23.631 |
| 899 | 47.684 | 72.322 | 23.046 |
| 900 | 48.95 | 75.02 | 22.88 |
| 901 | 50.316 | 77.474 | 23.157 |
| 902 | 51.708 | 79.571 | 23.844 |
| 903 | 53.214 | 81.438 | 24.991 |
| 904 | 54.654 | 82.808 | 26.5 |
| 905 | 56.14 | 83.859 | 28.421 |
| 906 | 57.696 | 84.71 | 30.682 |
| 907 | 58.819 | 85.156 | 32.482 |
| 908 | 60.258 | 85.498 | 35.017 |
| 909 | 61.668 | 85.646 | 37.69 |
| 910 | 62.92 | 85.536 | 40.304 |
| 911 | 64.04 | 85.219 | 42.86 |
| 912 | 65.021 | 84.78 | 45.263 |
| 913 | 65.759 | 84.085 | 47.433 |
| 914 | 66.192 | 83.108 | 49.276 |
| 915 | 66.466 | 81.748 | 51.184 |
| 916 | 66.401 | 80.482 | 52.321 |
| 917 | 66.143 | 79.145 | 53.141 |
| 918 | 65.718 | 77.746 | 53.69 |
| 919 | 65.137 | 76.363 | 53.912 |
| 920 | 64.462 | 75.088 | 53.835 |
| 921 | 63.687 | 73.927 | 53.448 |
| 922 | 62.858 | 72.902 | 52.814 |
| 923 | 62.001 | 72.039 | 51.964 |
| 924 | 61.141 | 71.345 | 50.937 |
| 925 | 60.058 | 70.832 | 49.285 |
| 926 | 59.302 | 70.695 | 47.909 |
| 927 | 58.496 | 70.611 | 46.381 |
| 928 | 57.851 | 70.859 | 44.843 |
| 929 | 57.317 | 71.315 | 43.319 |
| 930 | 56.825 | 72.141 | 41.509 |
| 931 | 56.565 | 72.964 | 40.167 |
| 932 | 56.502 | 74.001 | 39.004 |
| 933 | 56.53 | 75.076 | 37.984 |
| 934 | 56.751 | 76.486 | 37.015 |
| 935 | 56.982 | 77.487 | 36.477 |
| 936 | 57.323 | 78.45 | 36.197 |
| 937 | 57.861 | 79.599 | 36.122 |
| 938 | 58.303 | 80.326 | 36.28 |
| 939 | 58.833 | 80.949 | 36.717 |
| 940 | 59.459 | 81.475 | 37.443 |
| 941 | 60.016 | 81.825 | 38.207 |
| 942 | 60.694 | 82.113 | 39.275 |
| 943 | 61.256 | 82.239 | 40.274 |
| 944 | 61.879 | 82.248 | 41.511 |
| 945 | 62.407 | 82.287 | 42.527 |
| 946 | 63.015 | 82.213 | 43.817 |
| 947 | 63.448 | 82.12 | 44.777 |
| 948 | 63.941 | 81.988 | 45.894 |
| 949 | 64.375 | 81.908 | 46.842 |
| 950 | 64.684 | 81.843 | 47.525 |
| 951 | 64.954 | 81.689 | 48.22 |
| 952 | 65.236 | 81.663 | 48.809 |
| 953 | 65.405 | 81.668 | 49.142 |
| 954 | 65.565 | 81.652 | 49.479 |
| 955 | 65.694 | 81.688 | 49.701 |
| 956 | 65.812 | 81.786 | 49.839 |
| 957 | 65.91 | 81.926 | 49.895 |
| 958 | 65.994 | 82.095 | 49.892 |
| 959 | 66.09 | 82.299 | 49.88 |
| 960 | 66.169 | 82.496 | 49.843 |
| 961 | 66.284 | 82.752 | 49.816 |
| 962 | 66.374 | 82.96 | 49.789 |
| 963 | 66.551 | 83.248 | 49.855 |
| 964 | 66.66 | 83.365 | 49.954 |
| 965 | 66.858 | 83.594 | 50.122 |
| 966 | 67.009 | 83.712 | 50.307 |
| 967 | 67.219 | 83.854 | 50.585 |
| 968 | 67.383 | 83.862 | 50.905 |
| 969 | 67.596 | 83.888 | 51.304 |
| 970 | 67.851 | 83.944 | 51.758 |
| 971 | 68.016 | 83.843 | 52.189 |
| 972 | 68.206 | 83.773 | 52.64 |
| 973 | 68.405 | 83.7 | 53.11 |
| 974 | 68.561 | 83.568 | 53.555 |
| 975 | 68.778 | 83.55 | 54.005 |
| 976 | 68.922 | 83.397 | 54.447 |
| 977 | 69.064 | 83.399 | 54.73 |
| 978 | 69.176 | 83.357 | 54.994 |
| 979 | 69.257 | 83.406 | 55.108 |
| 980 | 69.286 | 83.439 | 55.134 |
| 981 | 69.332 | 83.561 | 55.103 |
| 982 | 69.37 | 83.81 | 54.93 |
| 983 | 69.334 | 83.993 | 54.674 |
| 984 | 69.303 | 84.284 | 54.322 |
| 985 | 69.228 | 84.529 | 53.927 |
| 986 | 69.159 | 84.858 | 53.461 |
| 987 | 69.11 | 85.241 | 52.979 |
| 988 | 68.979 | 85.6 | 52.359 |
| 989 | 68.97 | 86.029 | 51.912 |
| 990 | 68.898 | 86.357 | 51.438 |
| 991 | 68.857 | 86.657 | 51.056 |
| 992 | 68.839 | 86.903 | 50.774 |
| 993 | 68.781 | 87.001 | 50.561 |
| 994 | 68.761 | 87.05 | 50.472 |
| 995 | 68.768 | 87.007 | 50.529 |
| 996 | 68.721 | 86.744 | 50.697 |
| 997 | 68.716 | 86.346 | 51.086 |
| 998 | 68.682 | 85.783 | 51.581 |
| 999 | 68.634 | 85.034 | 52.234 |
| 1000 | 68.489 | 84.078 | 52.901 |
| 1001 | 68.319 | 82.874 | 53.764 |
| 1002 | 68.175 | 81.916 | 54.433 |
| 1003 | 67.992 | 80.615 | 55.369 |
| 1004 | 67.767 | 79.237 | 56.297 |
| 1005 | 67.594 | 78.003 | 57.185 |
| 1006 | 67.436 | 76.838 | 58.035 |
| 1007 | 67.337 | 75.905 | 58.769 |
| 1008 | 67.221 | 75.063 | 59.38 |
| 1009 | 67.151 | 74.453 | 59.848 |
| 1010 | 67.06 | 74.068 | 60.052 |
| 1011 | 66.98 | 73.765 | 60.196 |
| 1012 | 66.868 | 73.661 | 60.076 |
| 1013 | 66.731 | 73.74 | 59.722 |
| 1014 | 66.59 | 73.911 | 59.27 |
| 1015 | 66.436 | 74.429 | 58.443 |
| 1016 | 66.217 | 75.055 | 57.379 |
| 1017 | 66.096 | 75.906 | 56.286 |
| 1018 | 65.886 | 77.095 | 54.677 |
| 1019 | 65.7 | 78.209 | 53.19 |
| 1020 | 65.448 | 79.712 | 51.184 |
| 1021 | 65.168 | 80.964 | 49.372 |
| 1022 | 64.776 | 82.45 | 47.102 |
| 1023 | 64.368 | 83.498 | 45.238 |
| 1024 | 63.753 | 84.539 | 42.967 |
| 1025 | 63.223 | 85.193 | 41.253 |
| 1026 | 62.408 | 85.492 | 39.325 |
| 1027 | 61.759 | 85.432 | 38.087 |
| 1028 | 60.798 | 84.769 | 36.827 |
| 1029 | 59.918 | 83.705 | 36.131 |
| 1030 | 59.003 | 82.191 | 35.816 |
| 1031 | 57.733 | 79.596 | 35.87 |
| 1032 | 56.709 | 77.186 | 36.232 |
| 1033 | 55.885 | 74.768 | 37.001 |
| 1034 | 55.143 | 71.966 | 38.32 |
| 1035 | 54.948 | 70.135 | 39.761 |
| 1036 | 55.042 | 68.628 | 41.456 |
| 1037 | 55.377 | 67.426 | 43.327 |
| 1038 | 55.924 | 66.456 | 45.393 |
| 1039 | 56.829 | 65.631 | 48.028 |
| 1040 | 57.639 | 65.139 | 50.139 |
| 1041 | 58.478 | 64.873 | 52.083 |
| 1042 | 59.335 | 64.75 | 53.92 |
| 1043 | 60.245 | 64.957 | 55.533 |
| 1044 | 61.09 | 65.298 | 56.881 |
| 1045 | 62.193 | 66.181 | 58.205 |
| 1046 | 63.071 | 67.279 | 58.863 |
| 1047 | 63.934 | 68.693 | 59.175 |
| 1048 | 64.856 | 70.551 | 59.161 |
| 1049 | 65.906 | 73.104 | 58.708 |
| 1050 | 66.925 | 75.962 | 57.889 |
| 1051 | 67.903 | 79.184 | 56.623 |
| 1052 | 68.483 | 81.996 | 54.971 |
| 1053 | 68.554 | 84.224 | 52.884 |
| 1054 | 68.07 | 85.682 | 50.457 |
| 1055 | 66.918 | 86.21 | 47.626 |
| 1056 | 65.135 | 85.775 | 44.495 |
| 1057 | 62.984 | 84.655 | 41.313 |
| 1058 | 60.842 | 83.374 | 38.309 |
| 1059 | 58.72 | 82.203 | 35.236 |
| 1060 | 56.987 | 81.404 | 32.57 |
| 1061 | 55.607 | 80.926 | 30.288 |
| 1062 | 54.567 | 80.632 | 28.501 |
| 1063 | 53.834 | 80.426 | 27.242 |
| 1064 | 53.447 | 80.365 | 26.529 |
| 1065 | 53.311 | 80.173 | 26.449 |
| 1066 | 53.53 | 80.105 | 26.956 |
| 1067 | 54.121 | 80.177 | 28.064 |
| 1068 | 55.018 | 80.315 | 29.721 |
| 1069 | 56.36 | 80.623 | 32.096 |
| 1070 | 58.01 | 80.964 | 35.056 |
| 1071 | 59.99 | 81.53 | 38.451 |
| 1072 | 62.253 | 82.165 | 42.341 |
| 1073 | 64.775 | 83.142 | 46.407 |
| 1074 | 66.79 | 84.162 | 49.419 |
| 1075 | 69.692 | 85.862 | 53.521 |
| 1076 | 72.877 | 88.33 | 57.425 |
| 1077 | 76.039 | 91.188 | 60.89 |
| 1078 | 78.784 | 93.732 | 63.837 |
| 1079 | 81.023 | 95.743 | 66.303 |
| 1080 | 82.594 | 96.985 | 68.203 |
| 1081 | 83.622 | 97.586 | 69.658 |
| 1082 | 84.339 | 98.118 | 70.56 |
| 1083 | 84.685 | 98.286 | 71.083 |
| 1084 | 84.632 | 98.262 | 71.002 |
| 1085 | 84.216 | 97.926 | 70.506 |
| 1086 | 83.289 | 97.175 | 69.402 |
| 1087 | 82.002 | 96.325 | 67.679 |
| 1088 | 80.656 | 95.868 | 65.445 |
| 1089 | 79.02 | 95.538 | 62.501 |
| 1090 | 77.28 | 95.391 | 59.169 |
| 1091 | 75.36 | 95.219 | 55.501 |
| 1092 | 73.627 | 95.204 | 52.049 |
| 1093 | 71.963 | 95.112 | 48.814 |
| 1094 | 70.577 | 95.045 | 46.108 |
| 1095 | 69.614 | 94.984 | 44.244 |
| 1096 | 68.797 | 94.864 | 42.73 |
| 1097 | 68.518 | 94.83 | 42.205 |
| 1098 | 68.624 | 94.921 | 42.327 |
| 1099 | 68.983 | 94.973 | 42.993 |
| 1100 | 69.64 | 94.964 | 44.316 |
| 1101 | 70.468 | 94.974 | 45.963 |
| 1102 | 71.811 | 95.125 | 48.497 |
| 1103 | 73.863 | 95.288 | 52.439 |
| 1104 | 75.992 | 95.771 | 56.213 |
| 1105 | 78.628 | 96.728 | 60.527 |
| 1106 | 81.594 | 97.856 | 65.332 |
| 1107 | 84.452 | 98.879 | 70.026 |
| 1108 | 87.472 | 99.452 | 75.492 |
| 1109 | 89.448 | 99.592 | 79.304 |
| 1110 | 91.098 | 99.713 | 82.484 |
| 1111 | 92.346 | 99.678 | 85.013 |
| 1112 | 93.553 | 99.71 | 87.396 |
| 1113 | 94.25 | 99.675 | 88.824 |
| 1114 | 94.92 | 99.759 | 90.081 |
| 1115 | 95.296 | 99.775 | 90.817 |
| 1116 | 95.518 | 99.733 | 91.304 |
| 1117 | 95.705 | 99.76 | 91.649 |
| 1118 | 95.742 | 99.798 | 91.686 |
| 1119 | 95.623 | 99.782 | 91.465 |
| 1120 | 95.374 | 99.774 | 90.975 |
| 1121 | 94.79 | 99.802 | 89.777 |
| 1122 | 94.068 | 99.72 | 88.416 |
| 1123 | 92.718 | 99.766 | 85.669 |
| 1124 | 91.39 | 99.832 | 82.948 |
| 1125 | 89.65 | 99.758 | 79.541 |
| 1126 | 88.26 | 99.809 | 76.711 |
| 1127 | 87.475 | 99.774 | 75.176 |
| 1128 | 86.911 | 99.782 | 74.039 |
| 1129 | 86.698 | 99.849 | 73.547 |
| 1130 | 86.584 | 99.811 | 73.357 |
| 1131 | 86.551 | 99.81 | 73.292 |
| 1132 | 86.621 | 99.786 | 73.456 |
| 1133 | 86.735 | 99.798 | 73.673 |
| 1134 | 87.01 | 99.789 | 74.232 |
| 1135 | 87.427 | 99.8 | 75.053 |
| 1136 | 87.88 | 99.703 | 76.057 |
| 1137 | 88.649 | 99.783 | 77.514 |
| 1138 | 89.638 | 99.791 | 79.486 |
| 1139 | 90.971 | 99.779 | 82.163 |
| 1140 | 92.812 | 99.838 | 85.786 |
| 1141 | 94.688 | 99.748 | 89.628 |
| 1142 | 96.537 | 99.813 | 93.262 |
| 1143 | 97.77 | 99.74 | 95.8 |
| 1144 | 98.536 | 99.782 | 97.289 |
| 1145 | 98.996 | 99.771 | 98.222 |
| 1146 | 99.282 | 99.764 | 98.801 |
| 1147 | 99.485 | 99.782 | 99.187 |
| 1148 | 99.621 | 99.816 | 99.426 |
| 1149 | 99.72 | 99.837 | 99.602 |
| 1150 | 99.739 | 99.766 | 99.713 |
| 1151 | 99.844 | 99.818 | 99.871 |
| 1152 | 99.851 | 99.778 | 99.924 |
| 1153 | 99.896 | 99.789 | 100.003 |
| 1154 | 99.928 | 99.79 | 100.066 |
| 1155 | 99.924 | 99.791 | 100.056 |
| 1156 | 99.94 | 99.823 | 100.057 |
| 1157 | 99.954 | 99.772 | 100.137 |
| 1158 | 99.982 | 99.814 | 100.149 |
| 1159 | 99.981 | 99.835 | 100.127 |
| 1160 | 99.984 | 99.806 | 100.162 |
| 1161 | 99.972 | 99.765 | 100.18 |
| 1162 | 100.006 | 99.849 | 100.163 |
| 1163 | 100.004 | 99.788 | 100.221 |
| 1164 | 100.004 | 99.82 | 100.188 |
| 1165 | 100.011 | 99.81 | 100.211 |
| 1166 | 100.017 | 99.783 | 100.251 |
| 1167 | 100.016 | 99.835 | 100.197 |
| 1168 | 99.988 | 99.762 | 100.215 |
| 1169 | 100.042 | 99.834 | 100.249 |
| 1170 | 99.986 | 99.744 | 100.228 |
| 1171 | 100.014 | 99.767 | 100.262 |
| 1172 | 100.049 | 99.848 | 100.251 |
| 1173 | 100.036 | 99.807 | 100.264 |
| 1174 | 100.046 | 99.789 | 100.304 |
| 1175 | 100.02 | 99.803 | 100.236 |
| 1176 | 100.05 | 99.813 | 100.287 |
| 1177 | 100.004 | 99.753 | 100.254 |
| 1178 | 100.068 | 99.848 | 100.288 |
| 1179 | 100.055 | 99.83 | 100.28 |
| 1180 | 100.029 | 99.796 | 100.262 |
| 1181 | 100.062 | 99.827 | 100.297 |
| 1182 | 100.039 | 99.783 | 100.296 |
| 1183 | 100.031 | 99.794 | 100.268 |
| 1184 | 100.047 | 99.804 | 100.29 |
| 1185 | 100.014 | 99.76 | 100.267 |
| 1186 | 100.039 | 99.78 | 100.297 |
| 1187 | 100.045 | 99.776 | 100.314 |
| 1188 | 100.013 | 99.765 | 100.262 |
| 1189 | 100.031 | 99.792 | 100.27 |
| 1190 | 100.065 | 99.865 | 100.266 |
| 1191 | 100.012 | 99.752 | 100.271 |
| 1192 | 100.063 | 99.846 | 100.28 |
| 1193 | 100.063 | 99.805 | 100.321 |
| 1194 | 100.059 | 99.809 | 100.309 |
| 1195 | 100.053 | 99.818 | 100.288 |
| 1196 | 100.027 | 99.783 | 100.271 |
| 1197 | 100.08 | 99.864 | 100.296 |
| 1198 | 100.074 | 99.869 | 100.279 |
| 1199 | 100.056 | 99.813 | 100.299 |
| 1200 | 100.065 | 99.826 | 100.305 |
| 1201 | 100.075 | 99.842 | 100.308 |
| 1202 | 100.016 | 99.791 | 100.241 |
| 1203 | 100.043 | 99.82 | 100.266 |
| 1204 | 100.048 | 99.83 | 100.265 |
| 1205 | 100.041 | 99.807 | 100.274 |
| 1206 | 100.009 | 99.751 | 100.267 |
| 1207 | 100.008 | 99.746 | 100.269 |
| 1208 | 100.045 | 99.794 | 100.296 |
| 1209 | 100.029 | 99.775 | 100.283 |
| 1210 | 99.989 | 99.713 | 100.265 |
| 1211 | 100.062 | 99.878 | 100.246 |
| 1212 | 100.018 | 99.766 | 100.271 |
| 1213 | 100.053 | 99.837 | 100.268 |
| 1214 | 100.043 | 99.8 | 100.285 |
| 1215 | 100.04 | 99.797 | 100.282 |
| 1216 | 100.03 | 99.805 | 100.255 |
| 1217 | 100.045 | 99.794 | 100.297 |
| 1218 | 100.05 | 99.836 | 100.263 |
| 1219 | 100.017 | 99.742 | 100.291 |
| 1220 | 100.044 | 99.807 | 100.281 |
| 1221 | 100.004 | 99.783 | 100.226 |
| 1222 | 100.012 | 99.771 | 100.253 |
| 1223 | 100.01 | 99.761 | 100.259 |
| 1224 | 100.064 | 99.864 | 100.265 |
| 1225 | 100.033 | 99.769 | 100.297 |
| 1226 | 100.021 | 99.798 | 100.244 |
| 1227 | 100.003 | 99.774 | 100.232 |
| 1228 | 100.039 | 99.803 | 100.275 |
| 1229 | 100.034 | 99.805 | 100.262 |
| 1230 | 100.041 | 99.84 | 100.243 |
| 1231 | 100.031 | 99.817 | 100.245 |
| 1232 | 100.027 | 99.784 | 100.27 |
| 1233 | 100.01 | 99.8 | 100.219 |
| 1234 | 100.018 | 99.795 | 100.24 |
| 1235 | 100.002 | 99.79 | 100.214 |
| 1236 | 100.041 | 99.843 | 100.24 |
| 1237 | 99.995 | 99.787 | 100.202 |
| 1238 | 100.033 | 99.834 | 100.232 |
| 1239 | 100 | 99.782 | 100.217 |
| 1240 | 99.99 | 99.763 | 100.217 |
| 1241 | 100.024 | 99.838 | 100.21 |
| 1242 | 99.976 | 99.797 | 100.156 |
| 1243 | 99.977 | 99.787 | 100.167 |
| 1244 | 99.966 | 99.777 | 100.155 |
| 1245 | 99.956 | 99.764 | 100.147 |
| 1246 | 99.99 | 99.824 | 100.157 |
| 1247 | 99.948 | 99.777 | 100.12 |
| 1248 | 99.945 | 99.744 | 100.145 |
| 1249 | 99.929 | 99.768 | 100.089 |
| 1250 | 99.933 | 99.774 | 100.091 |
| 1251 | 99.919 | 99.755 | 100.084 |
| 1252 | 99.882 | 99.72 | 100.045 |
| 1253 | 99.898 | 99.793 | 100.003 |
| 1254 | 99.873 | 99.701 | 100.044 |
| 1255 | 99.878 | 99.767 | 99.988 |
| 1256 | 99.825 | 99.692 | 99.957 |
| 1257 | 99.854 | 99.753 | 99.955 |
| 1258 | 99.799 | 99.69 | 99.908 |
| 1259 | 99.769 | 99.719 | 99.819 |
| 1260 | 99.767 | 99.744 | 99.791 |
| 1261 | 99.726 | 99.748 | 99.705 |
| 1262 | 99.679 | 99.706 | 99.651 |
| 1263 | 99.625 | 99.719 | 99.532 |
| 1264 | 99.567 | 99.699 | 99.435 |
| 1265 | 99.567 | 99.747 | 99.387 |
| 1266 | 99.437 | 99.729 | 99.145 |
| 1267 | 99.358 | 99.729 | 98.986 |
| 1268 | 99.293 | 99.744 | 98.842 |
| 1269 | 99.141 | 99.692 | 98.591 |
| 1270 | 98.988 | 99.667 | 98.31 |
| 1271 | 98.829 | 99.69 | 97.968 |
| 1272 | 98.623 | 99.666 | 97.58 |
| 1273 | 98.415 | 99.726 | 97.105 |
| 1274 | 98.083 | 99.642 | 96.523 |
| 1275 | 97.649 | 99.655 | 95.643 |
| 1276 | 97.181 | 99.644 | 94.718 |
| 1277 | 96.649 | 99.651 | 93.646 |
| 1278 | 95.971 | 99.622 | 92.321 |
| 1279 | 95.234 | 99.632 | 90.836 |
| 1280 | 90.896 | 99.631 | 82.162 |
| 1281 | 89.298 | 99.594 | 79.003 |
| 1282 | 87.566 | 99.59 | 75.543 |
| 1283 | 85.649 | 99.497 | 71.801 |
| 1284 | 83.695 | 99.401 | 67.989 |
| 1285 | 81.636 | 99.3 | 63.972 |
| 1286 | 79.491 | 99.22 | 59.763 |
| 1287 | 77.297 | 99.024 | 55.571 |
| 1288 | 75.178 | 98.825 | 51.53 |
| 1289 | 72.91 | 98.55 | 47.27 |
| 1290 | 70.629 | 98.146 | 43.113 |
| 1291 | 68.332 | 97.634 | 39.03 |
| 1292 | 65.929 | 96.861 | 34.996 |
| 1293 | 63.518 | 95.961 | 31.075 |
| 1294 | 61.019 | 94.648 | 27.39 |
| 1295 | 58.488 | 93.169 | 23.806 |
| 1296 | 55.754 | 91.042 | 20.467 |
| 1297 | 52.956 | 88.584 | 17.328 |
| 1298 | 50.041 | 85.526 | 14.555 |
| 1299 | 47.157 | 82.314 | 12.001 |
| 1300 | 44.107 | 78.365 | 9.849 |
| 1301 | 41.083 | 74.276 | 7.891 |
| 1302 | 38.121 | 69.858 | 6.384 |
| 1303 | 35.344 | 65.623 | 5.065 |
| 1304 | 32.558 | 61.001 | 4.115 |
| 1305 | 29.905 | 56.448 | 3.361 |
| 1306 | 27.243 | 51.664 | 2.822 |
| 1307 | 24.838 | 47.241 | 2.435 |
| 1308 | 22.376 | 42.575 | 2.177 |
| 1309 | 20.111 | 38.236 | 1.986 |
| 1310 | 17.742 | 33.619 | 1.866 |
| 1311 | 14.562 | 27.414 | 1.709 |
| 1312 | 12.427 | 23.235 | 1.618 |
| 1313 | 10.557 | 19.571 | 1.542 |
| 1314 | 8.778 | 16.109 | 1.448 |
| 1315 | 7.214 | 13.066 | 1.361 |
| 1316 | 5.883 | 10.506 | 1.26 |
| 1317 | 4.785 | 8.403 | 1.166 |
| 1318 | 3.923 | 6.766 | 1.08 |
| 1319 | 3.251 | 5.515 | 0.988 |
| 1320 | 2.762 | 4.628 | 0.895 |
| 1321 | 2.428 | 4.039 | 0.817 |
| 1322 | 2.11 | 3.495 | 0.725 |
| 1323 | 1.97 | 3.285 | 0.655 |
| 1324 | 1.88 | 3.148 | 0.613 |
| 1325 | 1.804 | 3.029 | 0.578 |
| 1326 | 1.729 | 2.922 | 0.536 |
| 1327 | 1.657 | 2.794 | 0.521 |
| 1328 | 1.587 | 2.674 | 0.499 |
| 1329 | 1.512 | 2.534 | 0.491 |
| 1330 | 1.396 | 2.317 | 0.476 |
| 1331 | 1.315 | 2.156 | 0.474 |
| 1332 | 1.236 | 1.999 | 0.473 |
| 1333 | 1.155 | 1.845 | 0.465 |
| 1334 | 1.087 | 1.704 | 0.47 |
| 1335 | 1.012 | 1.56 | 0.463 |
| 1336 | 0.914 | 1.375 | 0.454 |
| 1337 | 0.847 | 1.248 | 0.446 |
| 1338 | 0.794 | 1.143 | 0.445 |
| 1339 | 0.748 | 1.052 | 0.444 |
| 1340 | 0.688 | 0.954 | 0.423 |
| 1341 | 0.625 | 0.842 | 0.409 |
| 1342 | 0.586 | 0.772 | 0.401 |
| 1343 | 0.551 | 0.708 | 0.393 |
| 1344 | 0.51 | 0.646 | 0.373 |
| 1345 | 0.485 | 0.612 | 0.359 |
| 1346 | 0.454 | 0.556 | 0.352 |
| 1347 | 0.443 | 0.534 | 0.351 |
| 1348 | 0.422 | 0.513 | 0.331 |
| 1349 | 0.411 | 0.492 | 0.33 |
| 1350 | 0.4 | 0.477 | 0.323 |
| 1351 | 0.393 | 0.469 | 0.316 |
| 1352 | 0.392 | 0.468 | 0.315 |
| 1353 | 0.4 | 0.474 | 0.326 |
| 1354 | 0.392 | 0.465 | 0.319 |
| 1355 | 0.394 | 0.464 | 0.324 |
| 1356 | 0.393 | 0.463 | 0.323 |
| 1357 | 0.398 | 0.468 | 0.328 |
| 1358 | 0.393 | 0.461 | 0.326 |
| 1359 | 0.395 | 0.453 | 0.338 |
| 1360 | 0.394 | 0.446 | 0.343 |
| 1361 | 0.393 | 0.444 | 0.342 |
| 1362 | 0.385 | 0.43 | 0.341 |
| 1363 | 0.387 | 0.429 | 0.346 |
| 1364 | 0.38 | 0.415 | 0.344 |
| 1365 | 0.372 | 0.401 | 0.344 |
| 1366 | 0.365 | 0.394 | 0.336 |
| 1367 | 0.358 | 0.38 | 0.335 |
| 1368 | 0.354 | 0.385 | 0.322 |
| 1369 | 0.353 | 0.384 | 0.321 |
| 1370 | 0.343 | 0.383 | 0.303 |
| 1371 | 0.348 | 0.401 | 0.296 |
| 1372 | 0.351 | 0.413 | 0.289 |
| 1373 | 0.356 | 0.442 | 0.271 |
| 1374 | 0.362 | 0.465 | 0.258 |
| 1375 | 0.38 | 0.513 | 0.246 |
| 1376 | 0.395 | 0.55 | 0.24 |
| 1377 | 0.409 | 0.591 | 0.228 |
| 1378 | 0.433 | 0.65 | 0.216 |
| 1379 | 0.457 | 0.698 | 0.215 |
| 1380 | 0.489 | 0.775 | 0.203 |
| 1381 | 0.509 | 0.816 | 0.202 |
| 1382 | 0.536 | 0.87 | 0.202 |
| 1383 | 0.575 | 0.944 | 0.206 |
| 1384 | 0.595 | 0.979 | 0.211 |
| 1385 | 0.638 | 1.054 | 0.221 |
| 1386 | 0.651 | 1.081 | 0.221 |
| 1387 | 0.683 | 1.119 | 0.248 |
| 1388 | 0.705 | 1.153 | 0.258 |
| 1389 | 0.728 | 1.171 | 0.285 |
| 1390 | 0.741 | 1.187 | 0.295 |
| 1391 | 0.757 | 1.198 | 0.316 |
| 1392 | 0.766 | 1.186 | 0.347 |
| 1393 | 0.767 | 1.172 | 0.362 |
| 1394 | 0.772 | 1.146 | 0.398 |
| 1395 | 0.772 | 1.125 | 0.419 |
| 1396 | 0.762 | 1.074 | 0.45 |
| 1397 | 0.754 | 1.038 | 0.47 |
| 1398 | 0.743 | 0.982 | 0.505 |
| 1399 | 0.732 | 0.945 | 0.519 |
| 1400 | 0.72 | 0.89 | 0.549 |
| 1401 | 0.705 | 0.847 | 0.564 |
| 1402 | 0.687 | 0.787 | 0.588 |
| 1403 | 0.677 | 0.757 | 0.597 |
| 1404 | 0.659 | 0.709 | 0.609 |
| 1405 | 0.651 | 0.684 | 0.618 |
| 1406 | 0.634 | 0.648 | 0.621 |
| 1407 | 0.63 | 0.64 | 0.619 |
| 1408 | 0.63 | 0.638 | 0.622 |
| 1409 | 0.629 | 0.637 | 0.621 |
| 1410 | 0.628 | 0.647 | 0.608 |
| 1411 | 0.637 | 0.668 | 0.607 |
| 1412 | 0.652 | 0.715 | 0.589 |
| 1413 | 0.66 | 0.742 | 0.577 |
| 1414 | 0.686 | 0.817 | 0.555 |
| 1415 | 0.699 | 0.86 | 0.539 |
| 1416 | 0.723 | 0.935 | 0.511 |
| 1417 | 0.755 | 1.025 | 0.484 |
| 1418 | 0.777 | 1.091 | 0.463 |
| 1419 | 0.808 | 1.186 | 0.431 |
| 1420 | 0.833 | 1.251 | 0.416 |
| 1421 | 0.863 | 1.343 | 0.384 |
| 1422 | 0.889 | 1.41 | 0.369 |
| 1423 | 0.916 | 1.494 | 0.338 |
| 1424 | 0.931 | 1.539 | 0.322 |
| 1425 | 0.956 | 1.616 | 0.297 |
| 1426 | 0.971 | 1.66 | 0.282 |
| 1427 | 0.983 | 1.709 | 0.257 |
| 1428 | 0.994 | 1.747 | 0.242 |
| 1429 | 1.005 | 1.78 | 0.231 |
| 1430 | 1.005 | 1.789 | 0.221 |
| 1431 | 1.007 | 1.807 | 0.206 |
| 1432 | 1.004 | 1.806 | 0.201 |
| 1433 | 0.994 | 1.797 | 0.191 |
| 1434 | 0.98 | 1.774 | 0.185 |
| 1435 | 0.968 | 1.751 | 0.185 |
| 1436 | 0.945 | 1.71 | 0.18 |
| 1437 | 0.935 | 1.685 | 0.184 |
| 1438 | 0.907 | 1.631 | 0.184 |
| 1439 | 0.891 | 1.598 | 0.183 |
| 1440 | 0.858 | 1.53 | 0.187 |
| 1441 | 0.837 | 1.488 | 0.187 |
| 1442 | 0.811 | 1.43 | 0.191 |
| 1443 | 0.793 | 1.386 | 0.2 |
| 1444 | 0.759 | 1.317 | 0.2 |
| 1445 | 0.738 | 1.273 | 0.204 |
| 1446 | 0.711 | 1.214 | 0.208 |
| 1447 | 0.691 | 1.165 | 0.217 |
| 1448 | 0.661 | 1.101 | 0.221 |
| 1449 | 0.644 | 1.059 | 0.23 |
| 1450 | 0.619 | 1.005 | 0.234 |
| 1451 | 0.601 | 0.969 | 0.234 |
| 1452 | 0.59 | 0.938 | 0.242 |
| 1453 | 0.567 | 0.888 | 0.246 |
| 1454 | 0.553 | 0.856 | 0.25 |
| 1455 | 0.536 | 0.814 | 0.259 |
| 1456 | 0.523 | 0.787 | 0.259 |
| 1457 | 0.506 | 0.745 | 0.267 |
| 1458 | 0.497 | 0.724 | 0.271 |
| 1459 | 0.481 | 0.688 | 0.275 |
| 1460 | 0.475 | 0.666 | 0.283 |
| 1461 | 0.466 | 0.646 | 0.287 |
| 1462 | 0.455 | 0.614 | 0.296 |
| 1463 | 0.449 | 0.599 | 0.3 |
| 1464 | 0.438 | 0.573 | 0.303 |
| 1465 | 0.43 | 0.552 | 0.307 |
| 1466 | 0.423 | 0.531 | 0.316 |
| 1467 | 0.422 | 0.52 | 0.324 |
| 1468 | 0.417 | 0.505 | 0.328 |
| 1469 | 0.418 | 0.499 | 0.336 |
| 1470 | 0.417 | 0.493 | 0.341 |
| 1471 | 0.418 | 0.488 | 0.349 |
| 1472 | 0.419 | 0.482 | 0.357 |
| 1473 | 0.416 | 0.472 | 0.361 |
| 1474 | 0.425 | 0.48 | 0.369 |
| 1475 | 0.429 | 0.485 | 0.373 |
| 1476 | 0.433 | 0.484 | 0.381 |
| 1477 | 0.442 | 0.498 | 0.385 |
| 1478 | 0.446 | 0.508 | 0.384 |
| 1479 | 0.453 | 0.523 | 0.383 |
| 1480 | 0.466 | 0.545 | 0.387 |
| 1481 | 0.471 | 0.554 | 0.387 |
| 1482 | 0.48 | 0.574 | 0.387 |
| 1483 | 0.497 | 0.607 | 0.386 |
| 1484 | 0.51 | 0.631 | 0.39 |
| 1485 | 0.522 | 0.659 | 0.385 |
| 1486 | 0.544 | 0.711 | 0.376 |
| 1487 | 0.567 | 0.763 | 0.371 |
| 1488 | 0.596 | 0.821 | 0.371 |
| 1489 | 0.632 | 0.898 | 0.366 |
| 1490 | 0.706 | 1.056 | 0.357 |
| 1491 | 0.772 | 1.195 | 0.348 |
| 1492 | 0.86 | 1.377 | 0.344 |
| 1493 | 0.966 | 1.602 | 0.331 |
| 1494 | 1.187 | 2.048 | 0.326 |
| 1495 | 1.382 | 2.447 | 0.317 |
| 1496 | 1.635 | 2.958 | 0.312 |
| 1497 | 1.898 | 3.489 | 0.308 |
| 1498 | 2.473 | 4.647 | 0.299 |
| 1499 | 2.95 | 5.611 | 0.29 |
| 1500 | 3.506 | 6.722 | 0.29 |
| 1501 | 4.135 | 7.98 | 0.29 |
| 1502 | 5.204 | 10.115 | 0.293 |
| 1503 | 6.036 | 11.778 | 0.293 |
| 1504 | 6.941 | 13.586 | 0.297 |
| 1505 | 8.003 | 15.7 | 0.305 |
| 1506 | 9.044 | 17.771 | 0.318 |
| 1507 | 10.821 | 21.304 | 0.339 |
| 1508 | 12.111 | 23.867 | 0.355 |
| 1509 | 13.366 | 26.352 | 0.38 |
| 1510 | 14.73 | 29.055 | 0.406 |
| 1511 | 16.194 | 31.958 | 0.431 |
| 1512 | 17.645 | 34.825 | 0.464 |
| 1513 | 19.926 | 39.321 | 0.532 |
| 1514 | 21.545 | 42.517 | 0.573 |
| 1515 | 23.023 | 45.422 | 0.623 |
| 1516 | 24.631 | 48.585 | 0.678 |
| 1517 | 26.258 | 51.78 | 0.737 |
| 1518 | 27.929 | 55.058 | 0.799 |
| 1519 | 29.437 | 58.004 | 0.871 |
| 1520 | 31.904 | 62.822 | 0.987 |
| 1521 | 33.44 | 65.821 | 1.058 |
| 1522 | 34.956 | 68.765 | 1.146 |
| 1523 | 36.397 | 71.564 | 1.231 |
| 1524 | 37.798 | 74.273 | 1.322 |
| 1525 | 39.124 | 76.837 | 1.411 |
| 1526 | 40.392 | 79.277 | 1.507 |
| 1527 | 41.571 | 81.536 | 1.605 |
| 1528 | 42.635 | 83.565 | 1.705 |
| 1529 | 43.622 | 85.442 | 1.802 |
| 1530 | 44.939 | 87.926 | 1.952 |
| 1531 | 45.737 | 89.42 | 2.055 |
| 1532 | 46.411 | 90.668 | 2.153 |
| 1533 | 47.041 | 91.823 | 2.26 |
| 1534 | 47.566 | 92.772 | 2.36 |
| 1535 | 48.08 | 93.694 | 2.465 |
| 1536 | 48.508 | 94.441 | 2.576 |
| 1537 | 48.877 | 95.066 | 2.688 |
| 1538 | 49.234 | 95.654 | 2.814 |
| 1539 | 49.558 | 96.178 | 2.938 |
| 1540 | 49.834 | 96.583 | 3.085 |
| 1541 | 50.112 | 96.974 | 3.249 |
| 1542 | 50.347 | 97.254 | 3.44 |
| 1543 | 50.616 | 97.572 | 3.659 |
| 1544 | 50.861 | 97.805 | 3.917 |
| 1545 | 51.105 | 98 | 4.211 |
| 1546 | 51.39 | 98.208 | 4.573 |
| 1547 | 51.666 | 98.337 | 4.995 |
| 1548 | 51.97 | 98.451 | 5.49 |
| 1549 | 52.328 | 98.583 | 6.073 |
| 1550 | 52.73 | 98.692 | 6.768 |
| 1551 | 53.173 | 98.797 | 7.548 |
| 1552 | 53.656 | 98.856 | 8.455 |
| 1553 | 54.173 | 98.932 | 9.415 |
| 1554 | 54.788 | 98.972 | 10.603 |
| 1555 | 55.467 | 99.025 | 11.909 |
| 1556 | 56.205 | 99.047 | 13.364 |
| 1557 | 57.011 | 99.073 | 14.949 |
| 1558 | 57.907 | 99.135 | 16.679 |
| 1559 | 58.797 | 99.086 | 18.508 |
| 1560 | 59.826 | 99.106 | 20.545 |
| 1561 | 60.901 | 99.061 | 22.741 |
| 1562 | 62.044 | 99.035 | 25.053 |
| 1563 | 63.215 | 98.935 | 27.495 |
| 1564 | 64.451 | 98.868 | 30.035 |
| 1565 | 65.726 | 98.802 | 32.651 |
| 1566 | 67.05 | 98.72 | 35.379 |
| 1567 | 68.394 | 98.63 | 38.159 |
| 1568 | 69.802 | 98.578 | 41.025 |
| 1569 | 71.212 | 98.556 | 43.869 |
| 1570 | 72.62 | 98.496 | 46.744 |
| 1571 | 74.039 | 98.506 | 49.572 |
| 1572 | 75.462 | 98.476 | 52.448 |
| 1573 | 76.855 | 98.491 | 55.22 |
| 1574 | 78.237 | 98.482 | 57.992 |
| 1575 | 79.58 | 98.483 | 60.676 |
| 1576 | 80.866 | 98.485 | 63.247 |
| 1577 | 82.103 | 98.49 | 65.716 |
| 1578 | 83.298 | 98.496 | 68.101 |
| 1579 | 84.432 | 98.54 | 70.325 |
| 1580 | 85.488 | 98.489 | 72.488 |
| 1581 | 86.489 | 98.54 | 74.437 |
| 1582 | 87.461 | 98.576 | 76.345 |
| 1583 | 88.343 | 98.59 | 78.096 |
| 1584 | 89.163 | 98.62 | 79.705 |
| 1585 | 89.902 | 98.634 | 81.169 |
| 1586 | 90.622 | 98.688 | 82.556 |
| 1587 | 90.913 | 98.66 | 83.167 |
| 1588 | 91.617 | 98.777 | 84.457 |
| 1589 | 92.19 | 98.842 | 85.537 |
| 1590 | 92.779 | 98.983 | 86.576 |
| 1591 | 93.291 | 99.097 | 87.484 |
| 1592 | 93.798 | 99.231 | 88.365 |
| 1593 | 94.231 | 99.363 | 89.099 |
| 1594 | 94.663 | 99.482 | 89.843 |
| 1595 | 95.024 | 99.592 | 90.457 |
| 1596 | 95.379 | 99.694 | 91.064 |
| 1597 | 95.661 | 99.735 | 91.588 |
| 1598 | 95.941 | 99.801 | 92.082 |
| 1599 | 96.16 | 99.827 | 92.493 |
| 1600 | 96.387 | 99.868 | 92.905 |
| 1601 | 96.547 | 99.871 | 93.223 |
| 1602 | 96.705 | 99.877 | 93.533 |
| 1603 | 96.87 | 99.905 | 93.836 |
| 1604 | 96.932 | 99.887 | 93.977 |
| 1605 | 97.059 | 99.913 | 94.204 |
| 1606 | 97.142 | 99.876 | 94.409 |
| 1607 | 97.258 | 99.932 | 94.584 |
| 1608 | 97.324 | 99.921 | 94.727 |
| 1609 | 97.392 | 99.926 | 94.858 |
| 1610 | 97.452 | 99.929 | 94.976 |
| 1611 | 97.476 | 99.926 | 95.026 |
| 1612 | 97.509 | 99.937 | 95.081 |
| 1613 | 97.517 | 99.914 | 95.12 |
| 1614 | 97.527 | 99.954 | 95.099 |
| 1615 | 97.483 | 99.9 | 95.065 |
| 1616 | 97.475 | 99.913 | 95.038 |
| 1617 | 97.428 | 99.932 | 94.923 |
| 1618 | 97.37 | 99.942 | 94.799 |
| 1619 | 97.274 | 99.92 | 94.629 |
| 1620 | 97.238 | 99.931 | 94.545 |
| 1621 | 97.131 | 99.937 | 94.325 |
| 1622 | 97.025 | 99.941 | 94.11 |
| 1623 | 96.904 | 99.953 | 93.855 |
| 1624 | 96.767 | 99.938 | 93.595 |
| 1625 | 96.612 | 99.911 | 93.313 |
| 1626 | 96.502 | 99.935 | 93.068 |
| 1627 | 96.399 | 99.959 | 92.84 |
| 1628 | 96.296 | 99.955 | 92.637 |
| 1629 | 96.233 | 99.955 | 92.512 |
| 1630 | 96.193 | 99.959 | 92.427 |
| 1631 | 96.17 | 99.959 | 92.381 |
| 1632 | 96.167 | 99.958 | 92.376 |
| 1633 | 96.21 | 99.957 | 92.462 |
| 1634 | 96.24 | 99.963 | 92.517 |
| 1635 | 96.303 | 99.933 | 92.673 |
| 1636 | 96.409 | 99.963 | 92.855 |
| 1637 | 96.525 | 99.926 | 93.123 |
| 1638 | 96.66 | 99.96 | 93.361 |
| 1639 | 96.823 | 99.967 | 93.678 |
| 1640 | 96.981 | 99.971 | 93.991 |
| 1641 | 97.211 | 99.971 | 94.452 |
| 1642 | 97.408 | 99.969 | 94.848 |
| 1643 | 97.627 | 99.955 | 95.299 |
| 1644 | 97.751 | 99.971 | 95.53 |
| 1645 | 98.004 | 99.96 | 96.047 |
| 1646 | 98.248 | 99.941 | 96.556 |
| 1647 | 98.485 | 99.924 | 97.045 |
| 1648 | 98.724 | 99.965 | 97.483 |
| 1649 | 98.931 | 99.979 | 97.883 |
| 1650 | 99.121 | 99.955 | 98.288 |
| 1651 | 99.287 | 99.978 | 98.596 |
| 1652 | 99.423 | 99.966 | 98.879 |
| 1653 | 99.551 | 99.964 | 99.137 |
| 1654 | 99.643 | 99.969 | 99.317 |
| 1655 | 99.71 | 99.967 | 99.454 |
| 1656 | 99.79 | 99.982 | 99.599 |
| 1657 | 99.821 | 99.952 | 99.69 |
| 1658 | 99.876 | 99.969 | 99.784 |
| 1659 | 99.906 | 99.932 | 99.881 |
| 1660 | 99.952 | 99.965 | 99.94 |
| 1661 | 100.088 | 100.066 | 100.111 |
| 1662 | 100.111 | 100.099 | 100.123 |
| 1663 | 100.144 | 100.109 | 100.18 |
| 1664 | 100.121 | 100.06 | 100.182 |
| 1665 | 100.167 | 100.135 | 100.198 |
| 1666 | 100.175 | 100.099 | 100.251 |
| 1667 | 100.173 | 100.093 | 100.253 |
| 1668 | 100.199 | 100.137 | 100.261 |
| 1669 | 100.147 | 100.035 | 100.26 |
| 1670 | 100.171 | 100.046 | 100.296 |
| 1671 | 100.189 | 100.09 | 100.287 |
| 1672 | 100.184 | 100.038 | 100.331 |
| 1673 | 100.185 | 100.07 | 100.301 |
| 1674 | 100.202 | 100.089 | 100.316 |
| 1675 | 100.194 | 100.067 | 100.321 |
| 1676 | 100.222 | 100.085 | 100.359 |
| 1677 | 100.229 | 100.109 | 100.349 |
| 1678 | 100.207 | 100.072 | 100.342 |
| 1679 | 100.233 | 100.091 | 100.375 |
| 1680 | 100.252 | 100.137 | 100.366 |
| 1681 | 100.224 | 100.058 | 100.389 |
| 1682 | 100.225 | 100.067 | 100.384 |
| 1683 | 100.218 | 100.039 | 100.397 |
| 1684 | 100.24 | 100.078 | 100.403 |
| 1685 | 100.258 | 100.097 | 100.419 |
| 1686 | 100.243 | 100.078 | 100.408 |
| 1687 | 100.239 | 100.077 | 100.401 |
| 1688 | 100.233 | 100.039 | 100.428 |
| 1689 | 100.253 | 100.075 | 100.431 |
| 1690 | 100.239 | 100.061 | 100.417 |
| 1691 | 100.258 | 100.111 | 100.404 |
| 1692 | 100.257 | 100.1 | 100.414 |
| 1693 | 100.263 | 100.093 | 100.432 |
| 1694 | 100.256 | 100.106 | 100.406 |
| 1695 | 100.251 | 100.096 | 100.406 |
| 1696 | 100.255 | 100.076 | 100.435 |
| 1697 | 100.245 | 100.085 | 100.405 |
| 1698 | 100.242 | 100.092 | 100.392 |
| 1699 | 100.242 | 100.082 | 100.402 |
| 1700 | 100.221 | 100.029 | 100.412 |
| 1701 | 100.27 | 100.12 | 100.419 |
| 1702 | 100.254 | 100.096 | 100.412 |
| 1703 | 100.253 | 100.09 | 100.416 |
| 1704 | 100.255 | 100.097 | 100.414 |
| 1705 | 100.244 | 100.097 | 100.391 |
| 1706 | 100.262 | 100.09 | 100.433 |
| 1707 | 100.271 | 100.113 | 100.429 |
| 1708 | 100.281 | 100.121 | 100.442 |
| 1709 | 100.258 | 100.087 | 100.43 |
| 1710 | 100.248 | 100.073 | 100.424 |
| 1711 | 100.252 | 100.108 | 100.396 |
| 1712 | 100.269 | 100.098 | 100.441 |
| 1713 | 100.252 | 100.084 | 100.419 |
| 1714 | 100.264 | 100.096 | 100.431 |
| 1715 | 100.262 | 100.106 | 100.417 |
| 1716 | 100.284 | 100.098 | 100.47 |
| 1717 | 100.244 | 100.071 | 100.418 |
| 1718 | 100.277 | 100.114 | 100.44 |
| 1719 | 100.265 | 100.106 | 100.425 |
| 1720 | 100.253 | 100.061 | 100.445 |
| 1721 | 100.26 | 100.085 | 100.435 |
| 1722 | 100.255 | 100.069 | 100.442 |
| 1723 | 100.289 | 100.135 | 100.443 |
| 1724 | 100.23 | 100.061 | 100.399 |
| 1725 | 100.252 | 100.085 | 100.419 |
| 1726 | 100.275 | 100.113 | 100.437 |
| 1727 | 100.278 | 100.113 | 100.442 |
| 1728 | 100.28 | 100.095 | 100.464 |
| 1729 | 100.23 | 100.047 | 100.414 |
| 1730 | 100.243 | 100.073 | 100.413 |
| 1731 | 100.273 | 100.083 | 100.463 |
| 1732 | 100.28 | 100.109 | 100.451 |
| 1733 | 100.286 | 100.118 | 100.455 |
| 1734 | 100.314 | 100.135 | 100.492 |
| 1735 | 100.295 | 100.139 | 100.451 |
| 1736 | 100.255 | 100.065 | 100.445 |
| 1737 | 100.261 | 100.084 | 100.437 |
| 1738 | 100.282 | 100.132 | 100.431 |
| 1739 | 100.264 | 100.082 | 100.446 |
| 1740 | 100.236 | 100.06 | 100.413 |
| 1741 | 100.275 | 100.133 | 100.416 |
| 1742 | 100.262 | 100.097 | 100.427 |
| 1743 | 100.262 | 100.11 | 100.414 |
| 1744 | 100.281 | 100.114 | 100.448 |
| 1745 | 100.285 | 100.145 | 100.425 |
| 1746 | 100.29 | 100.138 | 100.441 |
| 1747 | 100.27 | 100.079 | 100.461 |
| 1748 | 100.272 | 100.116 | 100.428 |
| 1749 | 100.251 | 100.075 | 100.428 |
| 1750 | 100.262 | 100.095 | 100.428 |
| 1751 | 100.275 | 100.106 | 100.444 |
| 1752 | 100.254 | 100.086 | 100.422 |
| 1753 | 100.255 | 100.09 | 100.421 |
| 1754 | 100.301 | 100.126 | 100.475 |
| 1755 | 100.26 | 100.091 | 100.43 |
| 1756 | 100.265 | 100.106 | 100.423 |
| 1757 | 100.27 | 100.103 | 100.437 |
| 1758 | 100.267 | 100.105 | 100.429 |
| 1759 | 100.275 | 100.102 | 100.447 |
| 1760 | 100.256 | 100.094 | 100.418 |
| 1761 | 100.285 | 100.118 | 100.451 |
| 1762 | 100.258 | 100.086 | 100.429 |
| 1763 | 100.263 | 100.116 | 100.409 |
| 1764 | 100.27 | 100.115 | 100.424 |
| 1765 | 100.26 | 100.115 | 100.406 |
| 1766 | 100.256 | 100.076 | 100.436 |
| 1767 | 100.254 | 100.086 | 100.422 |
| 1768 | 100.253 | 100.088 | 100.417 |
| 1769 | 100.264 | 100.116 | 100.413 |
| 1770 | 100.265 | 100.109 | 100.42 |
| 1771 | 100.266 | 100.072 | 100.46 |
| 1772 | 100.285 | 100.134 | 100.437 |
| 1773 | 100.258 | 100.091 | 100.425 |
| 1774 | 100.266 | 100.107 | 100.424 |
| 1775 | 100.28 | 100.114 | 100.445 |
| 1776 | 100.254 | 100.102 | 100.407 |
| 1777 | 100.277 | 100.125 | 100.429 |
| 1778 | 100.266 | 100.1 | 100.431 |
| 1779 | 100.273 | 100.11 | 100.436 |
| 1780 | 100.26 | 100.114 | 100.407 |
| 1781 | 100.264 | 100.091 | 100.438 |
| 1782 | 100.267 | 100.111 | 100.424 |
| 1783 | 100.265 | 100.1 | 100.431 |
| 1784 | 100.221 | 100.009 | 100.433 |
| 1785 | 100.28 | 100.134 | 100.426 |
| 1786 | 100.255 | 100.091 | 100.42 |
| 1787 | 100.265 | 100.12 | 100.41 |
| 1788 | 100.263 | 100.109 | 100.418 |
| 1789 | 100.242 | 100.082 | 100.402 |
| 1790 | 100.262 | 100.091 | 100.434 |
| 1791 | 100.262 | 100.102 | 100.423 |
| 1792 | 100.27 | 100.118 | 100.421 |
| 1793 | 100.284 | 100.132 | 100.436 |
| 1794 | 100.27 | 100.109 | 100.431 |
| 1795 | 100.274 | 100.139 | 100.409 |
| 1796 | 100.274 | 100.117 | 100.43 |
| 1797 | 100.262 | 100.103 | 100.42 |
| 1798 | 100.265 | 100.096 | 100.434 |
| 1799 | 100.242 | 100.084 | 100.401 |
| 1800 | 100.277 | 100.117 | 100.437 |
| 1801 | 100.246 | 100.077 | 100.415 |
| 1802 | 100.264 | 100.134 | 100.393 |
| 1803 | 100.22 | 100.061 | 100.38 |
| 1804 | 100.257 | 100.094 | 100.421 |
| 1805 | 100.265 | 100.125 | 100.404 |
| 1806 | 100.248 | 100.074 | 100.422 |
| 1807 | 100.276 | 100.111 | 100.442 |
| 1808 | 100.266 | 100.119 | 100.412 |
| 1809 | 100.252 | 100.094 | 100.41 |
| 1810 | 100.281 | 100.124 | 100.438 |
| 1811 | 100.267 | 100.128 | 100.407 |
| 1812 | 100.228 | 100.078 | 100.379 |
| 1813 | 100.243 | 100.063 | 100.423 |
| 1814 | 100.278 | 100.128 | 100.428 |
| 1815 | 100.254 | 100.117 | 100.39 |
| 1816 | 100.265 | 100.078 | 100.452 |
| 1817 | 100.252 | 100.086 | 100.418 |
| 1818 | 100.242 | 100.104 | 100.38 |
| 1819 | 100.272 | 100.122 | 100.422 |
| 1820 | 100.253 | 100.116 | 100.391 |
| 1821 | 100.259 | 100.124 | 100.395 |
| 1822 | 100.262 | 100.111 | 100.412 |
| 1823 | 100.235 | 100.063 | 100.407 |
| 1824 | 100.264 | 100.078 | 100.451 |
| 1825 | 100.278 | 100.097 | 100.46 |
| 1826 | 100.247 | 100.084 | 100.41 |
| 1827 | 100.268 | 100.1 | 100.435 |
| 1828 | 100.237 | 100.099 | 100.375 |
| 1829 | 100.249 | 100.09 | 100.409 |
| 1830 | 100.245 | 100.093 | 100.397 |
| 1831 | 100.254 | 100.096 | 100.413 |
| 1832 | 100.237 | 100.086 | 100.389 |
| 1833 | 100.257 | 100.108 | 100.407 |
| 1834 | 100.244 | 100.088 | 100.399 |
| 1835 | 100.245 | 100.083 | 100.406 |
| 1836 | 100.269 | 100.114 | 100.425 |
| 1837 | 100.238 | 100.071 | 100.404 |
| 1838 | 100.239 | 100.076 | 100.401 |
| 1839 | 100.242 | 100.078 | 100.405 |
| 1840 | 100.245 | 100.094 | 100.396 |
| 1841 | 100.264 | 100.101 | 100.426 |
| 1842 | 100.237 | 100.083 | 100.391 |
| 1843 | 100.28 | 100.121 | 100.439 |
| 1844 | 100.27 | 100.105 | 100.434 |
| 1845 | 100.239 | 100.1 | 100.377 |
| 1846 | 100.26 | 100.117 | 100.402 |
| 1847 | 100.266 | 100.1 | 100.432 |
| 1848 | 100.25 | 100.076 | 100.424 |
| 1849 | 100.285 | 100.153 | 100.417 |
| 1850 | 100.257 | 100.116 | 100.397 |
| 1851 | 100.278 | 100.114 | 100.441 |
| 1852 | 100.249 | 100.094 | 100.405 |
| 1853 | 100.263 | 100.129 | 100.398 |
| 1854 | 100.254 | 100.094 | 100.414 |
| 1855 | 100.27 | 100.137 | 100.404 |
| 1856 | 100.256 | 100.113 | 100.399 |
| 1857 | 100.243 | 100.08 | 100.407 |
| 1858 | 100.258 | 100.092 | 100.423 |
| 1859 | 100.287 | 100.143 | 100.431 |
| 1860 | 100.221 | 100.07 | 100.372 |
| 1861 | 100.218 | 100.067 | 100.369 |
| 1862 | 100.241 | 100.066 | 100.415 |
| 1863 | 100.238 | 100.079 | 100.397 |
| 1864 | 100.243 | 100.09 | 100.396 |
| 1865 | 100.262 | 100.119 | 100.406 |
| 1866 | 100.257 | 100.1 | 100.414 |
| 1867 | 100.24 | 100.085 | 100.394 |
| 1868 | 100.235 | 100.076 | 100.394 |
| 1869 | 100.23 | 100.063 | 100.397 |
| 1870 | 100.245 | 100.079 | 100.411 |
| 1871 | 100.219 | 100.072 | 100.366 |
| 1872 | 100.223 | 100.054 | 100.391 |
| 1873 | 100.248 | 100.08 | 100.416 |
| 1874 | 100.247 | 100.099 | 100.395 |
| 1875 | 100.236 | 100.082 | 100.39 |
| 1876 | 100.24 | 100.074 | 100.406 |
| 1877 | 100.225 | 100.076 | 100.374 |
| 1878 | 100.238 | 100.071 | 100.406 |
| 1879 | 100.271 | 100.085 | 100.458 |
| 1880 | 100.242 | 100.08 | 100.404 |
| 1881 | 100.249 | 100.108 | 100.391 |
| 1882 | 100.233 | 100.099 | 100.367 |
| 1883 | 100.282 | 100.104 | 100.46 |
| 1884 | 100.231 | 100.088 | 100.373 |
| 1885 | 100.263 | 100.1 | 100.425 |
| 1886 | 100.237 | 100.073 | 100.402 |
| 1887 | 100.247 | 100.082 | 100.412 |
| 1888 | 100.215 | 100.053 | 100.376 |
| 1889 | 100.226 | 100.073 | 100.379 |
| 1890 | 100.225 | 100.069 | 100.38 |
| 1891 | 100.221 | 100.057 | 100.385 |
| 1892 | 100.227 | 100.073 | 100.381 |
| 1893 | 100.217 | 100.061 | 100.372 |
| 1894 | 100.229 | 100.057 | 100.401 |
| 1895 | 100.238 | 100.075 | 100.4 |
| 1896 | 100.23 | 100.085 | 100.375 |
| 1897 | 100.242 | 100.101 | 100.383 |
| 1898 | 100.237 | 100.074 | 100.399 |
| 1899 | 100.229 | 100.052 | 100.406 |
| 1900 | 100.255 | 100.104 | 100.406 |
| 1901 | 100.21 | 100.077 | 100.342 |
| 1902 | 100.232 | 100.097 | 100.367 |
| 1903 | 100.248 | 100.112 | 100.383 |
| 1904 | 100.251 | 100.133 | 100.369 |
| 1905 | 100.264 | 100.137 | 100.391 |
| 1906 | 100.241 | 100.109 | 100.373 |
| 1907 | 100.238 | 100.087 | 100.39 |
| 1908 | 100.247 | 100.114 | 100.38 |
| 1909 | 100.218 | 100.087 | 100.348 |
| 1910 | 100.21 | 100.08 | 100.34 |
| 1911 | 100.227 | 100.106 | 100.347 |
| 1912 | 100.219 | 100.073 | 100.366 |
| 1913 | 100.236 | 100.109 | 100.362 |
| 1914 | 100.214 | 100.088 | 100.341 |
| 1915 | 100.212 | 100.112 | 100.312 |
| 1916 | 100.246 | 100.126 | 100.365 |
| 1917 | 100.216 | 100.101 | 100.331 |
| 1918 | 100.24 | 100.1 | 100.381 |
| 1919 | 100.215 | 100.092 | 100.338 |
| 1920 | 100.216 | 100.109 | 100.323 |
| 1921 | 100.229 | 100.107 | 100.35 |
| 1922 | 100.214 | 100.082 | 100.347 |
| 1923 | 100.203 | 100.064 | 100.341 |
| 1924 | 100.204 | 100.088 | 100.321 |
| 1925 | 100.203 | 100.086 | 100.321 |
| 1926 | 100.208 | 100.109 | 100.307 |
| 1927 | 100.2 | 100.099 | 100.302 |
| 1928 | 100.209 | 100.112 | 100.306 |
| 1929 | 100.21 | 100.108 | 100.312 |
| 1930 | 100.199 | 100.093 | 100.306 |
| 1931 | 100.189 | 100.098 | 100.279 |
| 1932 | 100.201 | 100.123 | 100.278 |
| 1933 | 100.168 | 100.078 | 100.258 |
| 1934 | 100.177 | 100.085 | 100.269 |
| 1935 | 100.194 | 100.086 | 100.302 |
| 1936 | 100.178 | 100.109 | 100.248 |
| 1937 | 100.162 | 100.118 | 100.206 |
| 1938 | 100.14 | 100.104 | 100.176 |
| 1939 | 100.152 | 100.136 | 100.168 |
| 1940 | 100.103 | 100.084 | 100.121 |
| 1941 | 100.109 | 100.079 | 100.138 |
| 1942 | 100.09 | 100.093 | 100.087 |
| 1943 | 100.087 | 100.147 | 100.027 |
| 1944 | 100.059 | 100.091 | 100.028 |
| 1945 | 100.051 | 100.116 | 99.985 |
| 1946 | 100.018 | 100.099 | 99.938 |
| 1947 | 99.995 | 100.148 | 99.841 |
| 1948 | 99.95 | 100.13 | 99.771 |
| 1949 | 99.897 | 100.129 | 99.666 |
| 1950 | 99.861 | 100.118 | 99.605 |
| 1951 | 99.841 | 100.123 | 99.56 |
| 1952 | 99.78 | 100.126 | 99.434 |
| 1953 | 99.709 | 100.108 | 99.311 |
| 1954 | 99.626 | 100.101 | 99.151 |
| 1955 | 99.53 | 100.057 | 99.002 |
| 1956 | 99.438 | 100.083 | 98.794 |
| 1957 | 99.36 | 100.105 | 98.614 |
| 1958 | 99.238 | 100.044 | 98.432 |
| 1959 | 99.138 | 100.035 | 98.241 |
| 1960 | 99.069 | 100.136 | 98.002 |
| 1961 | 98.956 | 100.126 | 97.786 |
| 1962 | 98.818 | 100.103 | 97.533 |
| 1963 | 98.712 | 100.088 | 97.337 |
| 1964 | 98.595 | 100.082 | 97.108 |
| 1965 | 98.503 | 100.104 | 96.901 |
| 1966 | 98.388 | 100.077 | 96.699 |
| 1967 | 98.301 | 100.076 | 96.526 |
| 1968 | 98.181 | 100.061 | 96.301 |
| 1969 | 98.096 | 100.082 | 96.11 |
| 1970 | 98.072 | 100.126 | 96.017 |
| 1971 | 97.963 | 100.088 | 95.838 |
| 1972 | 97.9 | 100.119 | 95.682 |
| 1973 | 97.826 | 100.108 | 95.544 |
| 1974 | 97.74 | 100.13 | 95.349 |
| 1975 | 97.669 | 100.071 | 95.266 |
| 1976 | 97.635 | 100.118 | 95.152 |
| 1977 | 97.543 | 100.08 | 95.005 |
| 1978 | 97.485 | 100.106 | 94.864 |
| 1979 | 97.427 | 100.077 | 94.776 |
| 1980 | 97.42 | 100.139 | 94.701 |
| 1981 | 97.379 | 100.085 | 94.674 |
| 1982 | 97.344 | 100.102 | 94.587 |
| 1983 | 97.313 | 100.101 | 94.525 |
| 1984 | 97.289 | 100.102 | 94.475 |
| 1985 | 97.286 | 100.134 | 94.437 |
| 1986 | 97.277 | 100.094 | 94.46 |
| 1987 | 97.279 | 100.084 | 94.474 |
| 1988 | 97.298 | 100.098 | 94.498 |
| 1989 | 97.327 | 100.132 | 94.521 |
| 1990 | 97.341 | 100.087 | 94.595 |
| 1991 | 97.356 | 100.084 | 94.628 |
| 1992 | 97.423 | 100.127 | 94.719 |
| 1993 | 97.446 | 100.107 | 94.784 |
| 1994 | 97.509 | 100.097 | 94.922 |
| 1995 | 97.529 | 100.058 | 95 |
| 1996 | 97.561 | 100.057 | 95.066 |
| 1997 | 97.626 | 100.089 | 95.162 |
| 1998 | 97.686 | 100.087 | 95.285 |
| 1999 | 97.742 | 100.1 | 95.384 |
| 2000 | 97.782 | 100.112 | 95.451 |
| 2001 | 97.788 | 100.079 | 95.497 |
| 2002 | 97.813 | 100.061 | 95.565 |
| 2003 | 97.82 | 100.065 | 95.575 |
| 2004 | 97.849 | 100.069 | 95.63 |
| 2005 | 97.845 | 100.076 | 95.614 |
| 2006 | 97.83 | 100.048 | 95.611 |
| 2007 | 97.796 | 100.037 | 95.554 |
| 2008 | 97.834 | 100.08 | 95.589 |
| 2009 | 97.816 | 100.109 | 95.522 |
| 2010 | 97.784 | 100.079 | 95.489 |
| 2011 | 97.743 | 100.048 | 95.437 |
| 2012 | 97.699 | 100.059 | 95.339 |
| 2013 | 97.681 | 100.103 | 95.258 |
| 2014 | 97.604 | 100.052 | 95.156 |
| 2015 | 97.546 | 100.067 | 95.025 |
| 2016 | 97.488 | 100.068 | 94.908 |
| 2017 | 97.413 | 100.043 | 94.783 |
| 2018 | 97.315 | 100.048 | 94.583 |
| 2019 | 97.246 | 100.057 | 94.435 |
| 2020 | 97.176 | 100.075 | 94.277 |
| 2021 | 97.038 | 100.049 | 94.026 |
| 2022 | 96.944 | 100.074 | 93.815 |
| 2023 | 96.835 | 100.065 | 93.604 |
| 2024 | 96.725 | 100.088 | 93.361 |
| 2025 | 96.603 | 100.135 | 93.07 |
| 2026 | 96.426 | 100.06 | 92.791 |
| 2027 | 96.271 | 100.072 | 92.471 |
| 2028 | 96.129 | 100.08 | 92.177 |
| 2029 | 95.935 | 100.078 | 91.792 |
| 2030 | 95.76 | 100.1 | 91.42 |
| 2031 | 95.566 | 100.092 | 91.041 |
| 2032 | 95.209 | 100.057 | 90.362 |
| 2033 | 95.014 | 100.082 | 89.945 |
| 2034 | 94.731 | 100.085 | 89.378 |
| 2035 | 94.49 | 100.057 | 88.923 |
| 2036 | 94.198 | 100.094 | 88.302 |
| 2037 | 93.915 | 100.07 | 87.761 |
| 2038 | 93.581 | 100.115 | 87.047 |
| 2039 | 93.258 | 100.083 | 86.434 |
| 2040 | 92.905 | 100.087 | 85.723 |
| 2041 | 92.552 | 100.13 | 84.974 |
| 2042 | 92.154 | 100.106 | 84.202 |
| 2043 | 91.74 | 100.055 | 83.425 |
| 2044 | 91.067 | 100.04 | 82.094 |
| 2045 | 90.635 | 100.058 | 81.211 |
| 2046 | 90.135 | 99.99 | 80.279 |
| 2047 | 89.649 | 100.051 | 79.248 |
| 2048 | 89.155 | 100.069 | 78.242 |
| 2049 | 88.633 | 100.058 | 77.208 |
| 2050 | 88.069 | 100.049 | 76.089 |
| 2051 | 87.49 | 99.998 | 74.982 |
| 2052 | 86.635 | 99.983 | 73.287 |
| 2053 | 86.019 | 99.972 | 72.065 |
| 2054 | 85.437 | 100.013 | 70.86 |
| 2055 | 84.793 | 100.001 | 69.585 |
| 2056 | 84.196 | 100.015 | 68.377 |
| 2057 | 83.502 | 99.989 | 67.015 |
| 2058 | 82.795 | 99.958 | 65.632 |
| 2059 | 81.753 | 99.955 | 63.55 |
| 2060 | 81.062 | 99.954 | 62.169 |
| 2061 | 80.306 | 99.932 | 60.679 |
| 2062 | 79.608 | 99.938 | 59.277 |
| 2063 | 78.894 | 99.896 | 57.892 |
| 2064 | 77.816 | 99.878 | 55.754 |
| 2065 | 77.162 | 99.873 | 54.451 |
| 2066 | 76.38 | 99.84 | 52.92 |
| 2067 | 75.735 | 99.821 | 51.65 |
| 2068 | 75.006 | 99.744 | 50.268 |
| 2069 | 73.864 | 99.662 | 48.066 |
| 2070 | 73.182 | 99.654 | 46.711 |
| 2071 | 72.474 | 99.601 | 45.348 |
| 2072 | 71.768 | 99.528 | 44.007 |
| 2073 | 70.723 | 99.483 | 41.963 |
| 2074 | 70.102 | 99.492 | 40.712 |
| 2075 | 69.408 | 99.426 | 39.39 |
| 2076 | 68.745 | 99.361 | 38.128 |
| 2077 | 67.761 | 99.273 | 36.248 |
| 2078 | 67.142 | 99.271 | 35.013 |
| 2079 | 66.546 | 99.215 | 33.877 |
| 2080 | 65.939 | 99.195 | 32.683 |
| 2081 | 65.061 | 99.14 | 30.982 |
| 2082 | 64.499 | 99.11 | 29.888 |
| 2083 | 63.976 | 99.077 | 28.875 |
| 2084 | 63.155 | 99.032 | 27.277 |
| 2085 | 62.633 | 99.008 | 26.257 |
| 2086 | 62.136 | 98.994 | 25.279 |
| 2087 | 61.413 | 98.95 | 23.877 |
| 2088 | 60.983 | 98.936 | 23.03 |
| 2089 | 60.525 | 98.943 | 22.107 |
| 2090 | 59.887 | 98.927 | 20.847 |
| 2091 | 59.499 | 98.959 | 20.039 |
| 2092 | 59.112 | 98.956 | 19.268 |
| 2093 | 58.561 | 98.942 | 18.179 |
| 2094 | 58.211 | 98.967 | 17.455 |
| 2095 | 57.889 | 98.954 | 16.823 |
| 2096 | 57.399 | 98.992 | 15.807 |
| 2097 | 57.062 | 98.957 | 15.168 |
| 2098 | 56.675 | 99.041 | 14.309 |
| 2099 | 56.389 | 99.055 | 13.723 |
| 2100 | 56.156 | 99.104 | 13.208 |
| 2101 | 55.742 | 99.105 | 12.38 |
| 2102 | 55.518 | 99.114 | 11.921 |
| 2103 | 55.171 | 99.093 | 11.25 |
| 2104 | 54.953 | 99.125 | 10.781 |
| 2105 | 54.743 | 99.115 | 10.372 |
| 2106 | 54.431 | 99.111 | 9.752 |
| 2107 | 54.209 | 99.061 | 9.357 |
| 2108 | 53.951 | 99.096 | 8.805 |
| 2109 | 53.782 | 99.117 | 8.447 |
| 2110 | 53.504 | 99.061 | 7.947 |
| 2111 | 53.366 | 99.108 | 7.624 |
| 2112 | 53.107 | 99.072 | 7.142 |
| 2113 | 52.974 | 99.063 | 6.886 |
| 2114 | 52.833 | 99.069 | 6.596 |
| 2115 | 52.656 | 99.104 | 6.207 |
| 2116 | 52.505 | 99.06 | 5.95 |
| 2117 | 52.329 | 99.055 | 5.603 |
| 2118 | 52.214 | 99.032 | 5.396 |
| 2119 | 52.056 | 99.023 | 5.088 |
| 2120 | 51.954 | 99.025 | 4.884 |
| 2121 | 51.778 | 98.938 | 4.618 |
| 2122 | 51.701 | 98.964 | 4.438 |
| 2123 | 51.532 | 98.857 | 4.207 |
| 2124 | 51.462 | 98.85 | 4.075 |
| 2125 | 51.375 | 98.865 | 3.885 |
| 2126 | 51.272 | 98.781 | 3.763 |
| 2127 | 51.184 | 98.77 | 3.598 |
| 2128 | 51.131 | 98.754 | 3.508 |
| 2129 | 51.046 | 98.703 | 3.39 |
| 2130 | 50.987 | 98.66 | 3.315 |
| 2131 | 50.897 | 98.58 | 3.213 |
| 2132 | 50.83 | 98.517 | 3.142 |
| 2133 | 50.796 | 98.483 | 3.109 |
| 2134 | 50.75 | 98.426 | 3.073 |
| 2135 | 50.718 | 98.374 | 3.062 |
| 2136 | 50.673 | 98.281 | 3.065 |
| 2137 | 50.656 | 98.233 | 3.079 |
| 2138 | 50.628 | 98.143 | 3.113 |
| 2139 | 50.593 | 98.038 | 3.147 |
| 2140 | 50.601 | 97.983 | 3.219 |
| 2141 | 50.578 | 97.885 | 3.271 |
| 2142 | 50.572 | 97.77 | 3.374 |
| 2143 | 50.564 | 97.631 | 3.497 |
| 2144 | 50.575 | 97.547 | 3.603 |
| 2145 | 50.583 | 97.394 | 3.773 |
| 2146 | 50.587 | 97.28 | 3.894 |
| 2147 | 50.603 | 97.112 | 4.094 |
| 2148 | 50.603 | 96.986 | 4.221 |
| 2149 | 50.637 | 96.804 | 4.47 |
| 2150 | 50.646 | 96.662 | 4.63 |
| 2151 | 50.653 | 96.418 | 4.887 |
| 2152 | 50.7 | 96.19 | 5.21 |
| 2153 | 50.708 | 96.002 | 5.414 |
| 2154 | 50.719 | 95.683 | 5.754 |
| 2155 | 50.756 | 95.511 | 6.001 |
| 2156 | 50.744 | 95.124 | 6.364 |
| 2157 | 50.751 | 94.872 | 6.631 |
| 2158 | 50.772 | 94.509 | 7.036 |
| 2159 | 50.771 | 94.231 | 7.311 |
| 2160 | 50.79 | 93.789 | 7.791 |
| 2161 | 50.745 | 93.229 | 8.26 |
| 2162 | 50.717 | 92.857 | 8.577 |
| 2163 | 50.693 | 92.289 | 9.096 |
| 2164 | 50.612 | 91.787 | 9.436 |
| 2165 | 50.541 | 91.091 | 9.992 |
| 2166 | 50.468 | 90.57 | 10.367 |
| 2167 | 50.322 | 89.695 | 10.948 |
| 2168 | 50.216 | 89.084 | 11.348 |
| 2169 | 50.028 | 88.089 | 11.968 |
| 2170 | 49.853 | 87.34 | 12.365 |
| 2171 | 49.603 | 86.18 | 13.025 |
| 2172 | 49.379 | 85.316 | 13.442 |
| 2173 | 49.013 | 83.93 | 14.097 |
| 2174 | 48.729 | 82.879 | 14.578 |
| 2175 | 48.296 | 81.333 | 15.26 |
| 2176 | 47.977 | 80.207 | 15.746 |
| 2177 | 47.35 | 78.249 | 16.452 |
| 2178 | 46.933 | 76.968 | 16.898 |
| 2179 | 46.265 | 74.886 | 17.644 |
| 2180 | 45.741 | 73.354 | 18.128 |
| 2181 | 44.954 | 71.032 | 18.876 |
| 2182 | 44.425 | 69.469 | 19.381 |
| 2183 | 43.527 | 66.963 | 20.092 |
| 2184 | 42.979 | 65.359 | 20.598 |
| 2185 | 42.043 | 62.753 | 21.332 |
| 2186 | 41.394 | 60.988 | 21.799 |
| 2187 | 40.464 | 58.392 | 22.536 |
| 2188 | 39.825 | 56.624 | 23.027 |
| 2189 | 38.854 | 53.986 | 23.721 |
| 2190 | 38.229 | 52.262 | 24.197 |
| 2191 | 37.285 | 49.683 | 24.887 |
| 2192 | 36.765 | 48.185 | 25.346 |
| 2193 | 36.177 | 46.581 | 25.774 |
| 2194 | 35.352 | 44.271 | 26.434 |
| 2195 | 34.819 | 42.774 | 26.864 |
| 2196 | 34.092 | 40.709 | 27.476 |
| 2197 | 33.665 | 39.442 | 27.888 |
| 2198 | 33.231 | 38.195 | 28.267 |
| 2199 | 32.632 | 36.456 | 28.808 |
| 2200 | 32.302 | 35.419 | 29.185 |
| 2201 | 31.858 | 34.021 | 29.695 |
| 2202 | 31.632 | 33.235 | 30.028 |
| 2203 | 31.382 | 32.421 | 30.343 |
| 2204 | 31.092 | 31.408 | 30.777 |
| 2205 | 30.92 | 30.765 | 31.076 |
| 2206 | 30.754 | 30.205 | 31.304 |
| 2207 | 30.589 | 29.477 | 31.701 |
| 2208 | 30.479 | 29.015 | 31.943 |
| 2209 | 30.397 | 28.619 | 32.175 |
| 2210 | 30.244 | 28.033 | 32.454 |
| 2211 | 30.152 | 27.698 | 32.605 |
| 2212 | 30.056 | 27.338 | 32.773 |
| 2213 | 29.897 | 26.819 | 32.974 |
| 2214 | 29.773 | 26.471 | 33.075 |
| 2215 | 29.63 | 26.081 | 33.179 |
| 2216 | 29.38 | 25.479 | 33.28 |
| 2217 | 29.189 | 25.053 | 33.324 |
| 2218 | 28.96 | 24.564 | 33.355 |
| 2219 | 28.583 | 23.816 | 33.35 |
| 2220 | 28.275 | 23.223 | 33.327 |
| 2221 | 27.987 | 22.678 | 33.296 |
| 2222 | 27.623 | 21.997 | 33.248 |
| 2223 | 27.069 | 21.017 | 33.122 |
| 2224 | 26.655 | 20.314 | 32.995 |
| 2225 | 26.231 | 19.592 | 32.87 |
| 2226 | 25.775 | 18.829 | 32.722 |
| 2227 | 25.095 | 17.712 | 32.477 |
| 2228 | 24.598 | 16.959 | 32.237 |
| 2229 | 24.095 | 16.175 | 32.014 |
| 2230 | 23.625 | 15.482 | 31.768 |
| 2231 | 23.133 | 14.781 | 31.484 |
| 2232 | 22.422 | 13.784 | 31.06 |
| 2233 | 21.967 | 13.209 | 30.725 |
| 2234 | 21.526 | 12.668 | 30.384 |
| 2235 | 21.124 | 12.259 | 29.989 |
| 2236 | 20.612 | 11.815 | 29.409 |
| 2237 | 20.35 | 11.68 | 29.02 |
| 2238 | 20.05 | 11.57 | 28.53 |
| 2239 | 19.84 | 11.586 | 28.094 |
| 2240 | 19.697 | 11.79 | 27.603 |
| 2241 | 19.567 | 12.035 | 27.099 |
| 2242 | 19.533 | 12.739 | 26.327 |
| 2243 | 19.572 | 13.325 | 25.819 |
| 2244 | 19.649 | 14.077 | 25.221 |
| 2245 | 19.801 | 14.908 | 24.694 |
| 2246 | 19.98 | 15.902 | 24.057 |
| 2247 | 20.243 | 17.016 | 23.471 |
| 2248 | 20.534 | 18.224 | 22.844 |
| 2249 | 21.112 | 20.316 | 21.909 |
| 2250 | 21.5 | 21.734 | 21.266 |
| 2251 | 21.97 | 23.334 | 20.606 |
| 2252 | 22.437 | 24.933 | 19.94 |
| 2253 | 23.033 | 26.779 | 19.286 |
| 2254 | 23.537 | 28.447 | 18.628 |
| 2255 | 24.13 | 30.294 | 17.965 |
| 2256 | 24.696 | 32.102 | 17.289 |
| 2257 | 25.351 | 34.061 | 16.641 |
| 2258 | 26.312 | 36.959 | 15.665 |
| 2259 | 26.925 | 38.842 | 15.008 |
| 2260 | 27.569 | 40.751 | 14.387 |
| 2261 | 28.158 | 42.6 | 13.716 |
| 2262 | 28.78 | 44.446 | 13.113 |
| 2263 | 29.383 | 46.263 | 12.502 |
| 2264 | 29.952 | 47.993 | 11.91 |
| 2265 | 30.507 | 49.691 | 11.323 |
| 2266 | 31.064 | 51.337 | 10.791 |
| 2267 | 31.544 | 52.862 | 10.226 |
| 2268 | 32.072 | 54.419 | 9.725 |
| 2269 | 32.547 | 55.865 | 9.229 |
| 2270 | 32.995 | 57.216 | 8.774 |
| 2271 | 33.448 | 58.561 | 8.335 |
| 2272 | 34.083 | 60.444 | 7.721 |
| 2273 | 34.455 | 61.524 | 7.387 |
| 2274 | 34.848 | 62.623 | 7.072 |
| 2275 | 35.184 | 63.592 | 6.776 |
| 2276 | 35.559 | 64.611 | 6.506 |
| 2277 | 35.865 | 65.432 | 6.297 |
| 2278 | 36.204 | 66.313 | 6.096 |
| 2279 | 36.493 | 67.036 | 5.95 |
| 2280 | 36.816 | 67.819 | 5.814 |
| 2281 | 37.081 | 68.416 | 5.747 |
| 2282 | 37.383 | 69.067 | 5.699 |
| 2283 | 37.641 | 69.591 | 5.69 |
| 2284 | 37.927 | 70.144 | 5.711 |
| 2285 | 38.201 | 70.618 | 5.785 |
| 2286 | 38.454 | 71.025 | 5.882 |
| 2287 | 38.694 | 71.382 | 6.005 |
| 2288 | 38.941 | 71.713 | 6.169 |
| 2289 | 39.205 | 72.051 | 6.36 |
| 2290 | 39.441 | 72.282 | 6.601 |
| 2291 | 39.691 | 72.517 | 6.866 |
| 2292 | 39.919 | 72.694 | 7.143 |
| 2293 | 40.144 | 72.808 | 7.481 |
| 2294 | 40.367 | 72.911 | 7.822 |
| 2295 | 40.587 | 72.973 | 8.2 |
| 2296 | 40.777 | 72.969 | 8.586 |
| 2297 | 40.986 | 72.955 | 9.017 |
| 2298 | 41.163 | 72.888 | 9.438 |
| 2299 | 41.336 | 72.789 | 9.883 |
| 2300 | 41.491 | 72.627 | 10.355 |
| 2301 | 41.659 | 72.48 | 10.838 |
| 2302 | 41.785 | 72.244 | 11.326 |
| 2303 | 41.927 | 72.017 | 11.838 |
| 2304 | 42.037 | 71.704 | 12.37 |
| 2305 | 42.099 | 71.324 | 12.874 |
| 2306 | 42.142 | 70.893 | 13.391 |
| 2307 | 42.207 | 70.49 | 13.924 |
| 2308 | 42.224 | 70.282 | 14.165 |
| 2309 | 42.234 | 69.744 | 14.725 |
| 2310 | 42.207 | 69.173 | 15.242 |
| 2311 | 42.143 | 68.501 | 15.784 |
| 2312 | 42.082 | 67.905 | 16.26 |
| 2313 | 41.949 | 67.093 | 16.804 |
| 2314 | 41.805 | 66.317 | 17.292 |
| 2315 | 41.64 | 65.472 | 17.808 |
| 2316 | 41.424 | 64.568 | 18.281 |
| 2317 | 41.153 | 63.526 | 18.779 |
| 2318 | 40.845 | 62.456 | 19.235 |
| 2319 | 40.507 | 61.314 | 19.7 |
| 2320 | 40.113 | 60.104 | 20.123 |
| 2321 | 39.672 | 58.776 | 20.567 |
| 2322 | 39.176 | 57.393 | 20.96 |
| 2323 | 38.65 | 55.943 | 21.357 |
| 2324 | 38.087 | 54.454 | 21.72 |
| 2325 | 37.457 | 52.837 | 22.076 |
| 2326 | 36.807 | 51.192 | 22.421 |
| 2327 | 36.08 | 49.416 | 22.744 |
| 2328 | 35.326 | 47.631 | 23.021 |
| 2329 | 34.531 | 45.745 | 23.317 |
| 2330 | 33.721 | 43.877 | 23.566 |
| 2331 | 32.856 | 41.904 | 23.808 |
| 2332 | 32.492 | 41.068 | 23.916 |
| 2333 | 31.563 | 39.004 | 24.122 |
| 2334 | 30.692 | 37.086 | 24.298 |
| 2335 | 29.765 | 35.067 | 24.464 |
| 2336 | 28.976 | 33.345 | 24.607 |
| 2337 | 28.04 | 31.369 | 24.71 |
| 2338 | 27.225 | 29.646 | 24.803 |
| 2339 | 26.406 | 27.924 | 24.888 |
| 2340 | 25.676 | 26.415 | 24.937 |
| 2341 | 24.92 | 24.863 | 24.978 |
| 2342 | 24.256 | 23.511 | 25 |
| 2343 | 23.623 | 22.269 | 24.977 |
| 2344 | 23.123 | 21.295 | 24.95 |
| 2345 | 22.645 | 20.371 | 24.918 |
| 2346 | 22.248 | 19.644 | 24.852 |
| 2347 | 21.891 | 19.019 | 24.763 |
| 2348 | 21.667 | 18.677 | 24.658 |
| 2349 | 21.518 | 18.497 | 24.539 |
| 2350 | 21.411 | 18.422 | 24.4 |
| 2351 | 21.416 | 18.586 | 24.247 |
| 2352 | 21.498 | 18.923 | 24.073 |
| 2353 | 21.663 | 19.445 | 23.88 |
| 2354 | 21.861 | 20.052 | 23.671 |
| 2355 | 22.205 | 20.942 | 23.467 |
| 2356 | 22.544 | 21.84 | 23.248 |
| 2357 | 23.001 | 23.014 | 22.988 |
| 2358 | 23.445 | 24.144 | 22.747 |
| 2359 | 24.023 | 25.56 | 22.486 |
| 2360 | 24.324 | 26.298 | 22.35 |
| 2361 | 24.945 | 27.8 | 22.089 |
| 2362 | 25.563 | 29.344 | 21.782 |
| 2363 | 26.233 | 30.974 | 21.492 |
| 2364 | 26.928 | 32.689 | 21.166 |
| 2365 | 27.627 | 34.37 | 20.883 |
| 2366 | 28.324 | 36.099 | 20.549 |
| 2367 | 29.059 | 37.872 | 20.247 |
| 2368 | 29.73 | 39.565 | 19.896 |
| 2369 | 30.422 | 41.276 | 19.568 |
| 2370 | 31.092 | 42.963 | 19.222 |
| 2371 | 31.731 | 44.544 | 18.919 |
| 2372 | 32.352 | 46.153 | 18.551 |
| 2373 | 32.945 | 47.646 | 18.244 |
| 2374 | 33.476 | 49.08 | 17.872 |
| 2375 | 34.025 | 50.486 | 17.565 |
| 2376 | 34.519 | 51.828 | 17.209 |
| 2377 | 34.98 | 53.047 | 16.912 |
| 2378 | 35.605 | 54.803 | 16.407 |
| 2379 | 36.004 | 55.915 | 16.093 |
| 2380 | 36.324 | 56.871 | 15.777 |
| 2381 | 36.678 | 57.874 | 15.482 |
| 2382 | 36.947 | 58.711 | 15.182 |
| 2383 | 37.256 | 59.606 | 14.906 |
| 2384 | 37.468 | 60.323 | 14.614 |
| 2385 | 37.697 | 61.047 | 14.346 |
| 2386 | 37.882 | 61.68 | 14.085 |
| 2387 | 38.062 | 62.295 | 13.829 |
| 2388 | 38.202 | 62.807 | 13.597 |
| 2389 | 38.343 | 63.314 | 13.372 |
| 2390 | 38.441 | 63.743 | 13.14 |
| 2391 | 38.56 | 64.183 | 12.937 |
| 2392 | 38.612 | 64.482 | 12.742 |
| 2393 | 38.689 | 64.821 | 12.558 |
| 2394 | 38.714 | 65.045 | 12.383 |
| 2395 | 38.741 | 65.256 | 12.227 |
| 2396 | 38.742 | 65.412 | 12.072 |
| 2397 | 38.754 | 65.648 | 11.86 |
| 2398 | 38.708 | 65.674 | 11.741 |
| 2399 | 38.688 | 65.744 | 11.632 |
| 2400 | 38.633 | 65.737 | 11.529 |
| 2401 | 38.56 | 65.682 | 11.439 |
| 2402 | 38.473 | 65.588 | 11.359 |
| 2403 | 38.378 | 65.475 | 11.281 |
| 2404 | 38.275 | 65.327 | 11.224 |
| 2405 | 38.158 | 65.149 | 11.168 |
| 2406 | 38.03 | 64.939 | 11.12 |
| 2407 | 37.804 | 64.538 | 11.07 |
| 2408 | 37.626 | 64.213 | 11.04 |
| 2409 | 37.458 | 63.894 | 11.023 |
| 2410 | 37.255 | 63.504 | 11.005 |
| 2411 | 37.062 | 63.119 | 11.004 |
| 2412 | 36.834 | 62.674 | 10.995 |
| 2413 | 36.597 | 62.196 | 10.998 |
| 2414 | 36.202 | 61.394 | 11.01 |
| 2415 | 35.921 | 60.818 | 11.025 |
| 2416 | 35.636 | 60.233 | 11.038 |
| 2417 | 35.334 | 59.609 | 11.059 |
| 2418 | 34.998 | 58.917 | 11.08 |
| 2419 | 34.656 | 58.221 | 11.091 |
| 2420 | 34.14 | 57.154 | 11.127 |
| 2421 | 33.755 | 56.349 | 11.161 |
| 2422 | 33.381 | 55.576 | 11.186 |
| 2423 | 32.951 | 54.688 | 11.213 |
| 2424 | 32.539 | 53.846 | 11.232 |
| 2425 | 31.868 | 52.471 | 11.265 |
| 2426 | 31.387 | 51.497 | 11.277 |
| 2427 | 30.94 | 50.579 | 11.3 |
| 2428 | 30.451 | 49.581 | 11.322 |
| 2429 | 29.73 | 48.119 | 11.34 |
| 2430 | 29.174 | 47.005 | 11.343 |
| 2431 | 28.688 | 46.026 | 11.35 |
| 2432 | 28.134 | 44.918 | 11.349 |
| 2433 | 27.329 | 43.307 | 11.351 |
| 2434 | 26.789 | 42.24 | 11.338 |
| 2435 | 26.244 | 41.152 | 11.336 |
| 2436 | 25.71 | 40.096 | 11.323 |
| 2437 | 24.856 | 38.429 | 11.283 |
| 2438 | 24.355 | 37.442 | 11.267 |
| 2439 | 23.769 | 36.299 | 11.24 |
| 2440 | 22.986 | 34.77 | 11.202 |
| 2441 | 22.456 | 33.755 | 11.157 |
| 2442 | 21.951 | 32.786 | 11.116 |
| 2443 | 21.45 | 31.828 | 11.072 |
| 2444 | 20.711 | 30.422 | 11 |
| 2445 | 20.248 | 29.565 | 10.931 |
| 2446 | 19.789 | 28.681 | 10.896 |
| 2447 | 19.17 | 27.543 | 10.797 |
| 2448 | 18.763 | 26.799 | 10.727 |
| 2449 | 18.377 | 26.086 | 10.668 |
| 2450 | 17.859 | 25.164 | 10.553 |
| 2451 | 17.516 | 24.563 | 10.469 |
| 2452 | 17.211 | 24.03 | 10.391 |
| 2453 | 16.816 | 23.37 | 10.261 |
| 2454 | 16.559 | 22.942 | 10.176 |
| 2455 | 16.26 | 22.472 | 10.048 |
| 2456 | 16.075 | 22.183 | 9.966 |
| 2457 | 15.914 | 21.966 | 9.863 |
| 2458 | 15.748 | 21.766 | 9.731 |
| 2459 | 15.672 | 21.703 | 9.641 |
| 2460 | 15.571 | 21.65 | 9.491 |
| 2461 | 15.555 | 21.707 | 9.402 |
| 2462 | 15.555 | 21.79 | 9.32 |
| 2463 | 15.595 | 22.007 | 9.183 |
| 2464 | 15.646 | 22.2 | 9.091 |
| 2465 | 15.761 | 22.559 | 8.963 |
| 2466 | 15.866 | 22.856 | 8.875 |
| 2467 | 16.05 | 23.339 | 8.761 |
| 2468 | 16.187 | 23.7 | 8.673 |
| 2469 | 16.435 | 24.3 | 8.571 |
| 2470 | 16.588 | 24.671 | 8.505 |
| 2471 | 16.802 | 25.157 | 8.446 |
| 2472 | 17.107 | 25.85 | 8.364 |
| 2473 | 17.3 | 26.289 | 8.31 |
| 2474 | 17.641 | 27.043 | 8.239 |
| 2475 | 17.857 | 27.508 | 8.206 |
| 2476 | 18.224 | 28.282 | 8.165 |
| 2477 | 18.47 | 28.792 | 8.147 |
| 2478 | 18.818 | 29.504 | 8.132 |
| 2479 | 19.089 | 30.036 | 8.142 |
| 2480 | 19.442 | 30.735 | 8.149 |
| 2481 | 19.7 | 31.23 | 8.169 |
| 2482 | 20.045 | 31.867 | 8.223 |
| 2483 | 20.285 | 32.307 | 8.264 |
| 2484 | 20.643 | 32.938 | 8.348 |
| 2485 | 20.88 | 33.345 | 8.416 |
| 2486 | 21.2 | 33.866 | 8.533 |
| 2487 | 21.521 | 34.364 | 8.679 |
| 2488 | 21.734 | 34.681 | 8.788 |
| 2489 | 22.03 | 35.079 | 8.981 |
| 2490 | 22.209 | 35.299 | 9.119 |
| 2491 | 22.476 | 35.612 | 9.341 |
| 2492 | 22.642 | 35.78 | 9.504 |
| 2493 | 22.883 | 35.993 | 9.773 |
| 2494 | 23.029 | 36.081 | 9.977 |
| 2495 | 23.246 | 36.203 | 10.289 |
| 2496 | 23.438 | 36.25 | 10.627 |
| 2497 | 23.546 | 36.225 | 10.867 |
| 2498 | 23.708 | 36.161 | 11.256 |
| 2499 | 23.787 | 36.079 | 11.494 |
| 2500 | 23.942 | 35.921 | 11.963 |
| 2501 | 24.004 | 35.756 | 12.253 |
| 2502 | 24.1 | 35.479 | 12.72 |
| 2503 | 24.185 | 35.141 | 13.228 |
| 2504 | 24.219 | 34.854 | 13.585 |
| 2505 | 24.274 | 34.449 | 14.098 |
| 2506 | 24.304 | 34.12 | 14.488 |
| 2507 | 24.322 | 33.579 | 15.065 |
| 2508 | 24.336 | 33.211 | 15.461 |
| 2509 | 24.338 | 32.611 | 16.065 |
| 2510 | 24.335 | 31.956 | 16.714 |
| 2511 | 24.347 | 31.548 | 17.146 |
| 2512 | 24.31 | 30.807 | 17.813 |
| 2513 | 24.302 | 30.338 | 18.265 |
| 2514 | 24.311 | 29.655 | 18.967 |
| 2515 | 24.301 | 29.15 | 19.452 |
| 2516 | 24.298 | 28.42 | 20.175 |
| 2517 | 24.317 | 27.717 | 20.918 |
| 2518 | 24.331 | 27.236 | 21.425 |
| 2519 | 24.356 | 26.541 | 22.17 |
| 2520 | 24.407 | 26.117 | 22.697 |
| 2521 | 24.517 | 25.524 | 23.509 |
| 2522 | 24.607 | 25.147 | 24.067 |
| 2523 | 24.723 | 24.624 | 24.821 |
| 2524 | 24.916 | 24.161 | 25.672 |
| 2525 | 25.088 | 23.938 | 26.237 |
| 2526 | 25.344 | 23.629 | 27.058 |
| 2527 | 25.547 | 23.49 | 27.603 |
| 2528 | 25.942 | 23.397 | 28.488 |
| 2529 | 26.19 | 23.336 | 29.044 |
| 2530 | 26.635 | 23.406 | 29.864 |
| 2531 | 27.03 | 23.541 | 30.52 |
| 2532 | 27.568 | 23.774 | 31.362 |
| 2533 | 27.982 | 24 | 31.965 |
| 2534 | 28.695 | 24.53 | 32.86 |
| 2535 | 29.402 | 25.086 | 33.717 |
| 2536 | 29.922 | 25.53 | 34.314 |
| 2537 | 30.787 | 26.382 | 35.192 |
| 2538 | 31.409 | 27.043 | 35.774 |
| 2539 | 32.354 | 28.041 | 36.668 |
| 2540 | 33.057 | 28.847 | 37.267 |
| 2541 | 34.103 | 30.079 | 38.127 |
| 2542 | 34.834 | 30.942 | 38.726 |
| 2543 | 35.965 | 32.334 | 39.596 |
| 2544 | 36.772 | 33.32 | 40.223 |
| 2545 | 37.969 | 34.883 | 41.055 |
| 2546 | 38.786 | 35.995 | 41.576 |
| 2547 | 40.024 | 37.582 | 42.467 |
| 2548 | 40.906 | 38.79 | 43.022 |
| 2549 | 41.726 | 39.839 | 43.613 |
| 2550 | 43.126 | 41.783 | 44.469 |
| 2551 | 44.018 | 42.998 | 45.039 |
| 2552 | 45.313 | 44.762 | 45.865 |
| 2553 | 46.263 | 46.112 | 46.413 |
| 2554 | 47.587 | 47.952 | 47.222 |
| 2555 | 48.499 | 49.222 | 47.777 |
| 2556 | 49.848 | 51.104 | 48.593 |
| 2557 | 50.728 | 52.287 | 49.169 |
| 2558 | 51.604 | 53.531 | 49.676 |
| 2559 | 52.924 | 55.36 | 50.487 |
| 2560 | 53.765 | 56.525 | 51.005 |
| 2561 | 55.021 | 58.239 | 51.803 |
| 2562 | 55.838 | 59.359 | 52.317 |
| 2563 | 56.645 | 60.464 | 52.825 |
| 2564 | 57.827 | 62.082 | 53.573 |
| 2565 | 58.66 | 63.177 | 54.143 |
| 2566 | 59.783 | 64.678 | 54.888 |
| 2567 | 60.514 | 65.633 | 55.396 |
| 2568 | 61.233 | 66.582 | 55.883 |
| 2569 | 62.312 | 68.011 | 56.614 |
| 2570 | 62.992 | 68.885 | 57.1 |
| 2571 | 63.669 | 69.761 | 57.577 |
| 2572 | 64.642 | 70.947 | 58.336 |
| 2573 | 65.247 | 71.719 | 58.775 |
| 2574 | 65.86 | 72.451 | 59.269 |
| 2575 | 66.745 | 73.52 | 59.97 |
| 2576 | 67.356 | 74.298 | 60.415 |
| 2577 | 67.911 | 74.934 | 60.889 |
| 2578 | 68.732 | 75.879 | 61.586 |
| 2579 | 69.264 | 76.473 | 62.056 |
| 2580 | 69.768 | 77.045 | 62.492 |
| 2581 | 70.272 | 77.595 | 62.95 |
| 2582 | 71.013 | 78.424 | 63.603 |
| 2583 | 71.454 | 78.914 | 63.993 |
| 2584 | 71.927 | 79.405 | 64.45 |
| 2585 | 72.623 | 80.137 | 65.108 |
| 2586 | 73.061 | 80.567 | 65.555 |
| 2587 | 73.483 | 81.006 | 65.961 |
| 2588 | 73.854 | 81.323 | 66.386 |
| 2589 | 74.476 | 81.958 | 66.995 |
| 2590 | 74.879 | 82.345 | 67.413 |
| 2591 | 75.252 | 82.687 | 67.817 |
| 2592 | 75.646 | 83.067 | 68.225 |
| 2593 | 76.042 | 83.401 | 68.682 |
| 2594 | 76.536 | 83.819 | 69.254 |
| 2595 | 76.829 | 84.045 | 69.613 |
| 2596 | 77.149 | 84.354 | 69.944 |
| 2597 | 77.5 | 84.651 | 70.349 |
| 2598 | 77.974 | 85.044 | 70.904 |
| 2599 | 78.293 | 85.308 | 71.279 |
| 2600 | 78.632 | 85.547 | 71.718 |